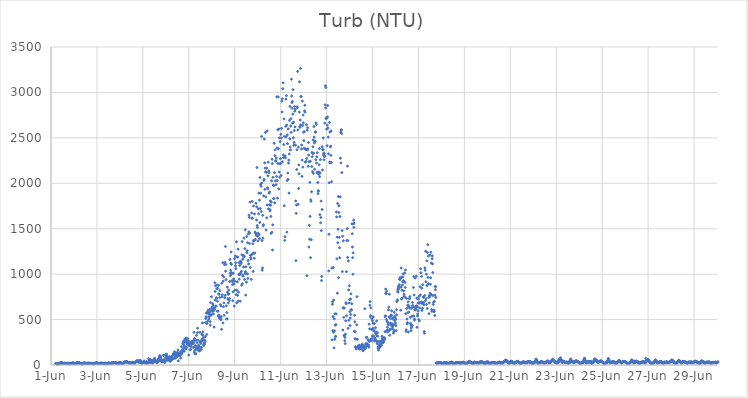
| Category | Turb (NTU) |
|---|---|
| 44348.208333333336 | 17.85 |
| 44348.21875 | 16.07 |
| 44348.229166666664 | 15.07 |
| 44348.239583333336 | 14.25 |
| 44348.25 | 13.07 |
| 44348.260416666664 | 12.13 |
| 44348.270833333336 | 12.9 |
| 44348.28125 | 11.44 |
| 44348.291666666664 | 12.86 |
| 44348.302083333336 | 12.12 |
| 44348.3125 | 12.98 |
| 44348.322916666664 | 14.67 |
| 44348.333333333336 | 13.97 |
| 44348.34375 | 14.42 |
| 44348.354166666664 | 16.25 |
| 44348.364583333336 | 13.14 |
| 44348.375 | 15.67 |
| 44348.385416666664 | 16.68 |
| 44348.395833333336 | 19.91 |
| 44348.40625 | 23.93 |
| 44348.416666666664 | 25.89 |
| 44348.427083333336 | 26.41 |
| 44348.4375 | 27.72 |
| 44348.447916666664 | 27.91 |
| 44348.458333333336 | 23.64 |
| 44348.46875 | 23.67 |
| 44348.479166666664 | 21.93 |
| 44348.489583333336 | 20.78 |
| 44348.5 | 20.99 |
| 44348.510416666664 | 19.15 |
| 44348.520833333336 | 20.27 |
| 44348.53125 | 17.49 |
| 44348.541666666664 | 16.05 |
| 44348.552083333336 | 17.76 |
| 44348.5625 | 17.19 |
| 44348.572916666664 | 16.97 |
| 44348.583333333336 | 18.19 |
| 44348.59375 | 17.05 |
| 44348.604166666664 | 18.88 |
| 44348.614583333336 | 17.87 |
| 44348.625 | 18.99 |
| 44348.635416666664 | 18.15 |
| 44348.645833333336 | 17.83 |
| 44348.65625 | 15.49 |
| 44348.666666666664 | 15.75 |
| 44348.677083333336 | 15.2 |
| 44348.6875 | 17.38 |
| 44348.697916666664 | 17.81 |
| 44348.708333333336 | 18.04 |
| 44348.71875 | 18.03 |
| 44348.729166666664 | 17.37 |
| 44348.739583333336 | 19.4 |
| 44348.75 | 18.3 |
| 44348.760416666664 | 17.67 |
| 44348.770833333336 | 16.87 |
| 44348.78125 | 15.52 |
| 44348.791666666664 | 14.73 |
| 44348.802083333336 | 13.63 |
| 44348.8125 | 12.52 |
| 44348.822916666664 | 15.52 |
| 44348.833333333336 | 14.12 |
| 44348.84375 | 16.25 |
| 44348.854166666664 | 16.66 |
| 44348.864583333336 | 17.64 |
| 44348.875 | 17.48 |
| 44348.885416666664 | 17.67 |
| 44348.895833333336 | 18.71 |
| 44348.90625 | 18.79 |
| 44348.916666666664 | 18.92 |
| 44348.927083333336 | 19.86 |
| 44348.9375 | 20.23 |
| 44348.947916666664 | 19.94 |
| 44348.958333333336 | 19.64 |
| 44348.96875 | 20.6 |
| 44348.979166666664 | 21.27 |
| 44348.989583333336 | 19.94 |
| 44349.0 | 19.46 |
| 44349.010416666664 | 18.15 |
| 44349.020833333336 | 17.81 |
| 44349.03125 | 16.41 |
| 44349.041666666664 | 16.4 |
| 44349.052083333336 | 15.35 |
| 44349.0625 | 16.81 |
| 44349.072916666664 | 17.22 |
| 44349.083333333336 | 18.48 |
| 44349.09375 | 19.93 |
| 44349.104166666664 | 20.25 |
| 44349.114583333336 | 21.39 |
| 44349.125 | 21.68 |
| 44349.135416666664 | 23.03 |
| 44349.145833333336 | 22.47 |
| 44349.15625 | 25.79 |
| 44349.166666666664 | 23.48 |
| 44349.177083333336 | 22.51 |
| 44349.1875 | 24.19 |
| 44349.197916666664 | 25 |
| 44349.208333333336 | 23.46 |
| 44349.21875 | 23.88 |
| 44349.229166666664 | 21.18 |
| 44349.239583333336 | 25.9 |
| 44349.25 | 16.99 |
| 44349.260416666664 | 19.4 |
| 44349.270833333336 | 17.35 |
| 44349.28125 | 15.46 |
| 44349.291666666664 | 15.87 |
| 44349.302083333336 | 14.51 |
| 44349.3125 | 13.87 |
| 44349.322916666664 | 13.88 |
| 44349.333333333336 | 12.87 |
| 44349.34375 | 13.28 |
| 44349.354166666664 | 12.64 |
| 44349.364583333336 | 13.79 |
| 44349.375 | 14.14 |
| 44349.385416666664 | 16.08 |
| 44349.395833333336 | 12.68 |
| 44349.40625 | 20.66 |
| 44349.416666666664 | 16.19 |
| 44349.427083333336 | 14.34 |
| 44349.4375 | 21.07 |
| 44349.447916666664 | 21.63 |
| 44349.458333333336 | 20.87 |
| 44349.46875 | 23.07 |
| 44349.479166666664 | 22.01 |
| 44349.489583333336 | 19.95 |
| 44349.5 | 18.13 |
| 44349.510416666664 | 18 |
| 44349.520833333336 | 17.74 |
| 44349.53125 | 17.18 |
| 44349.541666666664 | 16.9 |
| 44349.552083333336 | 16.03 |
| 44349.5625 | 15.2 |
| 44349.572916666664 | 13.88 |
| 44349.583333333336 | 18.49 |
| 44349.59375 | 15.82 |
| 44349.604166666664 | 21.06 |
| 44349.614583333336 | 19.11 |
| 44349.625 | 17.74 |
| 44349.635416666664 | 17.77 |
| 44349.645833333336 | 16.6 |
| 44349.65625 | 14.02 |
| 44349.666666666664 | 17.99 |
| 44349.677083333336 | 17.94 |
| 44349.6875 | 17.28 |
| 44349.697916666664 | 16.73 |
| 44349.708333333336 | 18.79 |
| 44349.71875 | 17.05 |
| 44349.729166666664 | 17.88 |
| 44349.739583333336 | 19.26 |
| 44349.75 | 17.71 |
| 44349.760416666664 | 17.61 |
| 44349.770833333336 | 17.71 |
| 44349.78125 | 16.47 |
| 44349.791666666664 | 17.19 |
| 44349.802083333336 | 17.46 |
| 44349.8125 | 15.03 |
| 44349.822916666664 | 14.03 |
| 44349.833333333336 | 12.57 |
| 44349.84375 | 12.94 |
| 44349.854166666664 | 12.1 |
| 44349.864583333336 | 14.65 |
| 44349.875 | 16.44 |
| 44349.885416666664 | 16.51 |
| 44349.895833333336 | 17.28 |
| 44349.90625 | 17.89 |
| 44349.916666666664 | 18.95 |
| 44349.927083333336 | 18.1 |
| 44349.9375 | 20.17 |
| 44349.947916666664 | 18.82 |
| 44349.958333333336 | 21.13 |
| 44349.96875 | 21.35 |
| 44349.979166666664 | 21.85 |
| 44349.989583333336 | 22.08 |
| 44350.0 | 22.59 |
| 44350.010416666664 | 22.57 |
| 44350.020833333336 | 22.45 |
| 44350.03125 | 20.55 |
| 44350.041666666664 | 19.71 |
| 44350.052083333336 | 18.04 |
| 44350.0625 | 16.86 |
| 44350.072916666664 | 16.02 |
| 44350.083333333336 | 15.61 |
| 44350.09375 | 14.43 |
| 44350.104166666664 | 15.7 |
| 44350.114583333336 | 16.55 |
| 44350.125 | 15.75 |
| 44350.135416666664 | 15.79 |
| 44350.145833333336 | 16.08 |
| 44350.15625 | 18.68 |
| 44350.166666666664 | 18.57 |
| 44350.177083333336 | 19.64 |
| 44350.1875 | 21.26 |
| 44350.197916666664 | 18.8 |
| 44350.208333333336 | 19.74 |
| 44350.21875 | 19.32 |
| 44350.229166666664 | 17.75 |
| 44350.239583333336 | 18.71 |
| 44350.25 | 18.85 |
| 44350.260416666664 | 16.88 |
| 44350.270833333336 | 17.99 |
| 44350.28125 | 17.18 |
| 44350.291666666664 | 16.92 |
| 44350.302083333336 | 17.74 |
| 44350.3125 | 18.36 |
| 44350.322916666664 | 16.48 |
| 44350.333333333336 | 15.77 |
| 44350.34375 | 14.31 |
| 44350.354166666664 | 11.96 |
| 44350.364583333336 | 15.38 |
| 44350.375 | 14.36 |
| 44350.385416666664 | 16.4 |
| 44350.395833333336 | 13.58 |
| 44350.40625 | 15.79 |
| 44350.416666666664 | 16.82 |
| 44350.427083333336 | 17.03 |
| 44350.4375 | 17.47 |
| 44350.447916666664 | 13.28 |
| 44350.458333333336 | 15.44 |
| 44350.46875 | 15.61 |
| 44350.479166666664 | 16.91 |
| 44350.489583333336 | 18.68 |
| 44350.5 | 20.53 |
| 44350.510416666664 | 20.93 |
| 44350.520833333336 | 19.89 |
| 44350.53125 | 20.03 |
| 44350.541666666664 | 18.54 |
| 44350.552083333336 | 18.82 |
| 44350.5625 | 19.69 |
| 44350.572916666664 | 17.64 |
| 44350.583333333336 | 18.13 |
| 44350.59375 | 17.07 |
| 44350.604166666664 | 16.56 |
| 44350.614583333336 | 17.87 |
| 44350.625 | 19.22 |
| 44350.635416666664 | 19.33 |
| 44350.645833333336 | 20.85 |
| 44350.65625 | 21.38 |
| 44350.666666666664 | 20.61 |
| 44350.677083333336 | 23.66 |
| 44350.6875 | 22.33 |
| 44350.697916666664 | 24.86 |
| 44350.708333333336 | 24.08 |
| 44350.71875 | 25.29 |
| 44350.729166666664 | 26.44 |
| 44350.739583333336 | 25.57 |
| 44350.75 | 27.58 |
| 44350.760416666664 | 25.7 |
| 44350.770833333336 | 24.64 |
| 44350.78125 | 26.09 |
| 44350.791666666664 | 27.63 |
| 44350.802083333336 | 24.21 |
| 44350.8125 | 24.14 |
| 44350.822916666664 | 21.72 |
| 44350.833333333336 | 22.23 |
| 44350.84375 | 21.31 |
| 44350.854166666664 | 19.41 |
| 44350.864583333336 | 19.21 |
| 44350.875 | 14.74 |
| 44350.885416666664 | 16.28 |
| 44350.895833333336 | 17.75 |
| 44350.90625 | 14.65 |
| 44350.916666666664 | 18.49 |
| 44350.927083333336 | 18.98 |
| 44350.9375 | 22.76 |
| 44350.947916666664 | 22.62 |
| 44350.958333333336 | 21.38 |
| 44350.96875 | 20.03 |
| 44350.979166666664 | 21.93 |
| 44350.989583333336 | 22.45 |
| 44351.0 | 21.67 |
| 44351.010416666664 | 22.64 |
| 44351.020833333336 | 22.24 |
| 44351.03125 | 23.25 |
| 44351.041666666664 | 22.71 |
| 44351.052083333336 | 21.84 |
| 44351.0625 | 20.34 |
| 44351.072916666664 | 19.56 |
| 44351.083333333336 | 18.44 |
| 44351.09375 | 18.37 |
| 44351.104166666664 | 19.43 |
| 44351.114583333336 | 16.82 |
| 44351.125 | 16.85 |
| 44351.135416666664 | 16.29 |
| 44351.145833333336 | 16.91 |
| 44351.15625 | 19.08 |
| 44351.166666666664 | 23.45 |
| 44351.177083333336 | 22.61 |
| 44351.1875 | 23.7 |
| 44351.197916666664 | 28.17 |
| 44351.208333333336 | 30.91 |
| 44351.21875 | 34.01 |
| 44351.229166666664 | 33.53 |
| 44351.239583333336 | 35.41 |
| 44351.25 | 38.29 |
| 44351.260416666664 | 38.94 |
| 44351.270833333336 | 36.71 |
| 44351.28125 | 36.52 |
| 44351.291666666664 | 34.05 |
| 44351.302083333336 | 35.5 |
| 44351.3125 | 33.63 |
| 44351.322916666664 | 31.69 |
| 44351.333333333336 | 33.26 |
| 44351.34375 | 30.76 |
| 44351.354166666664 | 29.39 |
| 44351.364583333336 | 28.56 |
| 44351.375 | 26.45 |
| 44351.385416666664 | 26 |
| 44351.395833333336 | 24.08 |
| 44351.40625 | 23.6 |
| 44351.416666666664 | 21.62 |
| 44351.427083333336 | 19.88 |
| 44351.4375 | 21.48 |
| 44351.447916666664 | 24.81 |
| 44351.458333333336 | 23.35 |
| 44351.46875 | 25.55 |
| 44351.479166666664 | 22.76 |
| 44351.489583333336 | 21.66 |
| 44351.5 | 27.77 |
| 44351.510416666664 | 29 |
| 44351.520833333336 | 28.95 |
| 44351.53125 | 29.71 |
| 44351.541666666664 | 29.24 |
| 44351.552083333336 | 26.77 |
| 44351.5625 | 24.59 |
| 44351.572916666664 | 24.35 |
| 44351.583333333336 | 22.07 |
| 44351.59375 | 23.46 |
| 44351.604166666664 | 23.51 |
| 44351.614583333336 | 23.75 |
| 44351.625 | 27.93 |
| 44351.635416666664 | 18.4 |
| 44351.645833333336 | 22.78 |
| 44351.65625 | 26.54 |
| 44351.666666666664 | 28.26 |
| 44351.677083333336 | 33.97 |
| 44351.6875 | 33.98 |
| 44351.697916666664 | 32.14 |
| 44351.708333333336 | 40.51 |
| 44351.71875 | 43.17 |
| 44351.729166666664 | 41.31 |
| 44351.739583333336 | 42.01 |
| 44351.75 | 46.94 |
| 44351.760416666664 | 44.83 |
| 44351.770833333336 | 40.1 |
| 44351.78125 | 40.45 |
| 44351.791666666664 | 41.38 |
| 44351.802083333336 | 43.02 |
| 44351.8125 | 40.6 |
| 44351.822916666664 | 45.24 |
| 44351.833333333336 | 30.93 |
| 44351.84375 | 28.58 |
| 44351.854166666664 | 39.39 |
| 44351.864583333336 | 43.09 |
| 44351.875 | 45.37 |
| 44351.885416666664 | 48.51 |
| 44351.895833333336 | 46.64 |
| 44351.90625 | 46.01 |
| 44351.916666666664 | 34.91 |
| 44351.927083333336 | 39.58 |
| 44351.9375 | 18.87 |
| 44351.947916666664 | 19.53 |
| 44351.958333333336 | 27.29 |
| 44351.96875 | 23.49 |
| 44351.979166666664 | 25.79 |
| 44351.989583333336 | 28.31 |
| 44352.0 | 29.22 |
| 44352.010416666664 | 29.58 |
| 44352.020833333336 | 29.78 |
| 44352.03125 | 31.6 |
| 44352.041666666664 | 28.29 |
| 44352.052083333336 | 30.88 |
| 44352.0625 | 43.72 |
| 44352.072916666664 | 31.56 |
| 44352.083333333336 | 26.26 |
| 44352.09375 | 27.5 |
| 44352.104166666664 | 26.5 |
| 44352.114583333336 | 27.31 |
| 44352.125 | 22.71 |
| 44352.135416666664 | 25 |
| 44352.145833333336 | 22.69 |
| 44352.15625 | 21.18 |
| 44352.166666666664 | 37.35 |
| 44352.177083333336 | 21.26 |
| 44352.1875 | 23.28 |
| 44352.197916666664 | 21.65 |
| 44352.208333333336 | 23.33 |
| 44352.21875 | 24.49 |
| 44352.229166666664 | 33.42 |
| 44352.239583333336 | 70.05 |
| 44352.25 | 35.85 |
| 44352.260416666664 | 34.89 |
| 44352.270833333336 | 30.18 |
| 44352.28125 | 31.63 |
| 44352.291666666664 | 35.97 |
| 44352.302083333336 | 48.26 |
| 44352.3125 | 35.88 |
| 44352.322916666664 | 61.89 |
| 44352.333333333336 | 31.15 |
| 44352.34375 | 27.95 |
| 44352.354166666664 | 27.7 |
| 44352.364583333336 | 50.33 |
| 44352.375 | 37.81 |
| 44352.385416666664 | 28.61 |
| 44352.395833333336 | 41.07 |
| 44352.40625 | 35.2 |
| 44352.416666666664 | 32.72 |
| 44352.427083333336 | 21.64 |
| 44352.4375 | 40.38 |
| 44352.447916666664 | 54.02 |
| 44352.458333333336 | 33.51 |
| 44352.46875 | 52.64 |
| 44352.479166666664 | 41.97 |
| 44352.489583333336 | 38.02 |
| 44352.5 | 58.2 |
| 44352.510416666664 | 74.88 |
| 44352.520833333336 | 64.57 |
| 44352.53125 | 50.5 |
| 44352.541666666664 | 37.51 |
| 44352.552083333336 | 40.25 |
| 44352.5625 | 35.63 |
| 44352.572916666664 | 45.71 |
| 44352.583333333336 | 31.49 |
| 44352.59375 | 38.78 |
| 44352.604166666664 | 38.75 |
| 44352.614583333336 | 29.01 |
| 44352.625 | 27.55 |
| 44352.635416666664 | 28.62 |
| 44352.645833333336 | 42.37 |
| 44352.65625 | 46.14 |
| 44352.666666666664 | 68.39 |
| 44352.677083333336 | 55.17 |
| 44352.6875 | 53.12 |
| 44352.697916666664 | 41.85 |
| 44352.708333333336 | 72.51 |
| 44352.71875 | 63.71 |
| 44352.729166666664 | 95.86 |
| 44352.739583333336 | 102.23 |
| 44352.75 | 94.01 |
| 44352.760416666664 | 95.13 |
| 44352.770833333336 | 90.69 |
| 44352.78125 | 84.67 |
| 44352.791666666664 | 67.16 |
| 44352.802083333336 | 47.5 |
| 44352.8125 | 44.14 |
| 44352.822916666664 | 51.01 |
| 44352.833333333336 | 36.93 |
| 44352.84375 | 37.6 |
| 44352.854166666664 | 37.08 |
| 44352.864583333336 | 36 |
| 44352.875 | 47.07 |
| 44352.885416666664 | 53.39 |
| 44352.895833333336 | 105.9 |
| 44352.90625 | 105.17 |
| 44352.916666666664 | 57 |
| 44352.927083333336 | 35.35 |
| 44352.9375 | 33.79 |
| 44352.947916666664 | 30.16 |
| 44352.958333333336 | 29.21 |
| 44352.96875 | 50.52 |
| 44352.979166666664 | 43.6 |
| 44352.989583333336 | 76.88 |
| 44353.0 | 116.6 |
| 44353.010416666664 | 87.84 |
| 44353.020833333336 | 107.22 |
| 44353.03125 | 118.88 |
| 44353.041666666664 | 55.02 |
| 44353.052083333336 | 68.74 |
| 44353.0625 | 53.42 |
| 44353.072916666664 | 68.28 |
| 44353.083333333336 | 83.18 |
| 44353.09375 | 89.84 |
| 44353.104166666664 | 56.17 |
| 44353.114583333336 | 61.85 |
| 44353.125 | 56.83 |
| 44353.135416666664 | 56.09 |
| 44353.145833333336 | 72 |
| 44353.15625 | 67.99 |
| 44353.166666666664 | 92.34 |
| 44353.177083333336 | 74.19 |
| 44353.1875 | 45.8 |
| 44353.197916666664 | 40.81 |
| 44353.208333333336 | 54.73 |
| 44353.21875 | 73.79 |
| 44353.229166666664 | 78.64 |
| 44353.239583333336 | 50.18 |
| 44353.25 | 91.39 |
| 44353.260416666664 | 75.49 |
| 44353.270833333336 | 74.68 |
| 44353.28125 | 97.75 |
| 44353.291666666664 | 66.84 |
| 44353.302083333336 | 72.04 |
| 44353.3125 | 68.23 |
| 44353.322916666664 | 117.46 |
| 44353.333333333336 | 118.39 |
| 44353.34375 | 128.01 |
| 44353.354166666664 | 119.22 |
| 44353.364583333336 | 119.96 |
| 44353.375 | 137.56 |
| 44353.385416666664 | 145.94 |
| 44353.395833333336 | 74.16 |
| 44353.40625 | 100.51 |
| 44353.416666666664 | 120.41 |
| 44353.427083333336 | 112.63 |
| 44353.4375 | 80.36 |
| 44353.447916666664 | 89.55 |
| 44353.458333333336 | 119.23 |
| 44353.46875 | 97.2 |
| 44353.479166666664 | 107.55 |
| 44353.489583333336 | 92.38 |
| 44353.5 | 120 |
| 44353.510416666664 | 139.45 |
| 44353.520833333336 | 123.11 |
| 44353.53125 | 165.12 |
| 44353.541666666664 | 46.11 |
| 44353.552083333336 | 126.15 |
| 44353.5625 | 104.93 |
| 44353.572916666664 | 111.69 |
| 44353.583333333336 | 110.53 |
| 44353.59375 | 108.09 |
| 44353.604166666664 | 105.6 |
| 44353.614583333336 | 109.18 |
| 44353.625 | 106.96 |
| 44353.635416666664 | 143.26 |
| 44353.645833333336 | 76.15 |
| 44353.65625 | 132.72 |
| 44353.666666666664 | 128.19 |
| 44353.677083333336 | 203.21 |
| 44353.6875 | 131.46 |
| 44353.697916666664 | 125.43 |
| 44353.708333333336 | 161.03 |
| 44353.71875 | 142.62 |
| 44353.729166666664 | 171.73 |
| 44353.739583333336 | 233.69 |
| 44353.75 | 171.88 |
| 44353.760416666664 | 257.77 |
| 44353.770833333336 | 250.94 |
| 44353.78125 | 188.13 |
| 44353.791666666664 | 218.44 |
| 44353.802083333336 | 151.59 |
| 44353.8125 | 207.01 |
| 44353.822916666664 | 279.67 |
| 44353.833333333336 | 248.93 |
| 44353.84375 | 288.87 |
| 44353.854166666664 | 268.61 |
| 44353.864583333336 | 284.29 |
| 44353.875 | 178.12 |
| 44353.885416666664 | 277.24 |
| 44353.895833333336 | 295.56 |
| 44353.90625 | 194.42 |
| 44353.916666666664 | 245.82 |
| 44353.927083333336 | 252.08 |
| 44353.9375 | 224.45 |
| 44353.947916666664 | 230.15 |
| 44353.958333333336 | 288.77 |
| 44353.96875 | 263.06 |
| 44353.979166666664 | 240.55 |
| 44353.989583333336 | 260.5 |
| 44354.0 | 109.41 |
| 44354.010416666664 | 214.73 |
| 44354.020833333336 | 242.39 |
| 44354.03125 | 220.57 |
| 44354.041666666664 | 230.61 |
| 44354.052083333336 | 167.12 |
| 44354.0625 | 213.1 |
| 44354.072916666664 | 218.9 |
| 44354.083333333336 | 171.55 |
| 44354.09375 | 203.04 |
| 44354.104166666664 | 250.13 |
| 44354.114583333336 | 253.6 |
| 44354.125 | 238.21 |
| 44354.135416666664 | 246.68 |
| 44354.145833333336 | 255.12 |
| 44354.15625 | 233.05 |
| 44354.166666666664 | 235.19 |
| 44354.177083333336 | 251.48 |
| 44354.1875 | 266.5 |
| 44354.197916666664 | 191.96 |
| 44354.208333333336 | 242.02 |
| 44354.21875 | 269.42 |
| 44354.229166666664 | 359.93 |
| 44354.239583333336 | 141.14 |
| 44354.25 | 289.66 |
| 44354.260416666664 | 160.17 |
| 44354.270833333336 | 123.07 |
| 44354.28125 | 214.51 |
| 44354.291666666664 | 200.41 |
| 44354.302083333336 | 273.36 |
| 44354.3125 | 123.96 |
| 44354.322916666664 | 172.63 |
| 44354.333333333336 | 325.3 |
| 44354.34375 | 200.34 |
| 44354.354166666664 | 246.55 |
| 44354.364583333336 | 191 |
| 44354.375 | 355.65 |
| 44354.385416666664 | 405.62 |
| 44354.395833333336 | 184.52 |
| 44354.40625 | 272.7 |
| 44354.416666666664 | 160.17 |
| 44354.427083333336 | 218.47 |
| 44354.4375 | 207.4 |
| 44354.447916666664 | 181.84 |
| 44354.458333333336 | 161.26 |
| 44354.46875 | 153.79 |
| 44354.479166666664 | 359.55 |
| 44354.489583333336 | 254.72 |
| 44354.5 | 192.12 |
| 44354.510416666664 | 259.23 |
| 44354.520833333336 | 236.84 |
| 44354.53125 | 253.24 |
| 44354.541666666664 | 169.14 |
| 44354.552083333336 | 191.68 |
| 44354.5625 | 338.4 |
| 44354.572916666664 | 284.12 |
| 44354.583333333336 | 267.43 |
| 44354.59375 | 463.25 |
| 44354.604166666664 | 330.39 |
| 44354.614583333336 | 363.42 |
| 44354.625 | 280.48 |
| 44354.635416666664 | 301.14 |
| 44354.645833333336 | 212.95 |
| 44354.65625 | 223.66 |
| 44354.666666666664 | 229.57 |
| 44354.677083333336 | 244.43 |
| 44354.6875 | 231.66 |
| 44354.697916666664 | 271.87 |
| 44354.708333333336 | 255.72 |
| 44354.71875 | 313.21 |
| 44354.729166666664 | 468.1 |
| 44354.739583333336 | 512.35 |
| 44354.75 | 527.61 |
| 44354.760416666664 | 528.84 |
| 44354.770833333336 | 571.52 |
| 44354.78125 | 336.27 |
| 44354.791666666664 | 455.08 |
| 44354.802083333336 | 577.58 |
| 44354.8125 | 577.97 |
| 44354.822916666664 | 481.7 |
| 44354.833333333336 | 571.96 |
| 44354.84375 | 604.09 |
| 44354.854166666664 | 597.85 |
| 44354.864583333336 | 563.2 |
| 44354.875 | 506.18 |
| 44354.885416666664 | 530.46 |
| 44354.895833333336 | 559.66 |
| 44354.90625 | 574.88 |
| 44354.916666666664 | 610.34 |
| 44354.927083333336 | 477.73 |
| 44354.9375 | 438.96 |
| 44354.947916666664 | 687.68 |
| 44354.958333333336 | 547.04 |
| 44354.96875 | 595.07 |
| 44354.979166666664 | 552.72 |
| 44354.989583333336 | 751.48 |
| 44355.0 | 622.74 |
| 44355.010416666664 | 636.25 |
| 44355.020833333336 | 622.7 |
| 44355.03125 | 591.52 |
| 44355.041666666664 | 673.37 |
| 44355.052083333336 | 627.64 |
| 44355.0625 | 657.28 |
| 44355.072916666664 | 562.12 |
| 44355.083333333336 | 597.35 |
| 44355.09375 | 616.25 |
| 44355.104166666664 | 416.86 |
| 44355.114583333336 | 628.23 |
| 44355.125 | 610.71 |
| 44355.135416666664 | 905.19 |
| 44355.145833333336 | 809.61 |
| 44355.15625 | 714.43 |
| 44355.166666666664 | 871.69 |
| 44355.177083333336 | 646.54 |
| 44355.1875 | 648.88 |
| 44355.197916666664 | 740.19 |
| 44355.208333333336 | 736.57 |
| 44355.21875 | 838.51 |
| 44355.229166666664 | 881.53 |
| 44355.239583333336 | 591.51 |
| 44355.25 | 701.06 |
| 44355.260416666664 | 844.31 |
| 44355.270833333336 | 591.96 |
| 44355.28125 | 538.32 |
| 44355.291666666664 | 876.88 |
| 44355.302083333336 | 783 |
| 44355.3125 | 550.72 |
| 44355.322916666664 | 777.66 |
| 44355.333333333336 | 516.76 |
| 44355.34375 | 741.84 |
| 44355.354166666664 | 819.46 |
| 44355.364583333336 | 529.81 |
| 44355.375 | 664.98 |
| 44355.385416666664 | 506.16 |
| 44355.395833333336 | 498.33 |
| 44355.40625 | 649.35 |
| 44355.416666666664 | 531.36 |
| 44355.427083333336 | 392.89 |
| 44355.4375 | 899.6 |
| 44355.447916666664 | 750.97 |
| 44355.458333333336 | 773.02 |
| 44355.46875 | 986.4 |
| 44355.479166666664 | 1126.12 |
| 44355.489583333336 | 463.15 |
| 44355.5 | 923.03 |
| 44355.510416666664 | 641.79 |
| 44355.520833333336 | 970.09 |
| 44355.53125 | 682.07 |
| 44355.541666666664 | 547.61 |
| 44355.552083333336 | 1106.27 |
| 44355.5625 | 740.06 |
| 44355.572916666664 | 1129.07 |
| 44355.583333333336 | 766.36 |
| 44355.59375 | 1304.26 |
| 44355.604166666664 | 1031.29 |
| 44355.614583333336 | 1106.24 |
| 44355.625 | 939.1 |
| 44355.635416666664 | 651.26 |
| 44355.645833333336 | 506.11 |
| 44355.65625 | 576.97 |
| 44355.666666666664 | 508.57 |
| 44355.677083333336 | 856.69 |
| 44355.6875 | 801.46 |
| 44355.697916666664 | 728.44 |
| 44355.708333333336 | 778.46 |
| 44355.71875 | 683.21 |
| 44355.729166666664 | 783.29 |
| 44355.739583333336 | 826.35 |
| 44355.75 | 783.45 |
| 44355.760416666664 | 711.05 |
| 44355.770833333336 | 730.46 |
| 44355.78125 | 919.41 |
| 44355.791666666664 | 1161.86 |
| 44355.802083333336 | 1010.73 |
| 44355.8125 | 984.35 |
| 44355.822916666664 | 1041.88 |
| 44355.833333333336 | 1118.16 |
| 44355.84375 | 1243.56 |
| 44355.854166666664 | 1107.01 |
| 44355.864583333336 | 1015.07 |
| 44355.875 | 1003.14 |
| 44355.885416666664 | 929.24 |
| 44355.895833333336 | 916.61 |
| 44355.90625 | 884.47 |
| 44355.916666666664 | 706.69 |
| 44355.927083333336 | 805.04 |
| 44355.9375 | 1010.44 |
| 44355.947916666664 | 926.06 |
| 44355.958333333336 | 946.62 |
| 44355.96875 | 890.94 |
| 44355.979166666664 | 648.55 |
| 44355.989583333336 | 1170.06 |
| 44356.0 | 822.72 |
| 44356.010416666664 | 920.44 |
| 44356.020833333336 | 1200.23 |
| 44356.03125 | 1091.6 |
| 44356.041666666664 | 1126.57 |
| 44356.052083333336 | 1060.79 |
| 44356.0625 | 773.5 |
| 44356.072916666664 | 1356.23 |
| 44356.083333333336 | 684.24 |
| 44356.09375 | 824 |
| 44356.104166666664 | 1187.98 |
| 44356.114583333336 | 915.86 |
| 44356.125 | 766.58 |
| 44356.135416666664 | 1187.22 |
| 44356.145833333336 | 1275.39 |
| 44356.15625 | 701.5 |
| 44356.166666666664 | 802.69 |
| 44356.177083333336 | 995.66 |
| 44356.1875 | 1125.98 |
| 44356.197916666664 | 944.09 |
| 44356.208333333336 | 995.66 |
| 44356.21875 | 1094.65 |
| 44356.229166666664 | 998.25 |
| 44356.239583333336 | 702.42 |
| 44356.25 | 1142.83 |
| 44356.260416666664 | 1015.14 |
| 44356.270833333336 | 1116.98 |
| 44356.28125 | 1129.71 |
| 44356.291666666664 | 1030.83 |
| 44356.302083333336 | 878.9 |
| 44356.3125 | 1212.5 |
| 44356.322916666664 | 1358.48 |
| 44356.333333333336 | 895.23 |
| 44356.34375 | 989.69 |
| 44356.354166666664 | 1164.28 |
| 44356.364583333336 | 976.8 |
| 44356.375 | 1206.9 |
| 44356.385416666664 | 1078.78 |
| 44356.395833333336 | 1190.08 |
| 44356.40625 | 1395.83 |
| 44356.416666666664 | 1197.72 |
| 44356.427083333336 | 940.71 |
| 44356.4375 | 1281.54 |
| 44356.447916666664 | 1008.96 |
| 44356.458333333336 | 1488.75 |
| 44356.46875 | 1028.37 |
| 44356.479166666664 | 769.44 |
| 44356.489583333336 | 1080.5 |
| 44356.5 | 1004.04 |
| 44356.510416666664 | 912.4 |
| 44356.520833333336 | 1413.98 |
| 44356.53125 | 1235.76 |
| 44356.541666666664 | 1258.57 |
| 44356.552083333336 | 1002.31 |
| 44356.5625 | 1346.86 |
| 44356.572916666664 | 952.94 |
| 44356.583333333336 | 1149.75 |
| 44356.59375 | 1443.2 |
| 44356.604166666664 | 1112.71 |
| 44356.614583333336 | 1464.85 |
| 44356.625 | 1649.7 |
| 44356.635416666664 | 1624.68 |
| 44356.645833333336 | 1337.34 |
| 44356.65625 | 1453.15 |
| 44356.666666666664 | 1792.38 |
| 44356.677083333336 | 1073.87 |
| 44356.6875 | 1206.86 |
| 44356.697916666664 | 1183.1 |
| 44356.708333333336 | 1167.63 |
| 44356.71875 | 942.16 |
| 44356.729166666664 | 1213.25 |
| 44356.739583333336 | 1673.3 |
| 44356.75 | 1616.6 |
| 44356.760416666664 | 1801.05 |
| 44356.770833333336 | 1616.06 |
| 44356.78125 | 1225.73 |
| 44356.791666666664 | 1334.06 |
| 44356.802083333336 | 1030 |
| 44356.8125 | 1369.18 |
| 44356.822916666664 | 1750.47 |
| 44356.833333333336 | 1230.34 |
| 44356.84375 | 1367.25 |
| 44356.854166666664 | 1174.54 |
| 44356.864583333336 | 1662.88 |
| 44356.875 | 1233.61 |
| 44356.885416666664 | 1463.5 |
| 44356.895833333336 | 1381.16 |
| 44356.90625 | 1448.75 |
| 44356.916666666664 | 1448.82 |
| 44356.927083333336 | 1780.76 |
| 44356.9375 | 1426.65 |
| 44356.947916666664 | 1595.84 |
| 44356.958333333336 | 1741.18 |
| 44356.96875 | 2173.06 |
| 44356.979166666664 | 1535.1 |
| 44356.989583333336 | 1512.93 |
| 44357.0 | 1419.17 |
| 44357.010416666664 | 1365.6 |
| 44357.020833333336 | 1449.71 |
| 44357.03125 | 1718.05 |
| 44357.041666666664 | 1663.8 |
| 44357.052083333336 | 1891.66 |
| 44357.0625 | 1435.11 |
| 44357.072916666664 | 1814.21 |
| 44357.083333333336 | 1390.91 |
| 44357.09375 | 1568.79 |
| 44357.104166666664 | 2063.89 |
| 44357.114583333336 | 1722.75 |
| 44357.125 | 1987.44 |
| 44357.135416666664 | 1890.64 |
| 44357.145833333336 | 1966.86 |
| 44357.15625 | 1688.53 |
| 44357.166666666664 | 2515.73 |
| 44357.177083333336 | 2002.57 |
| 44357.1875 | 1368.57 |
| 44357.197916666664 | 1043.53 |
| 44357.208333333336 | 1068.62 |
| 44357.21875 | 1647.4 |
| 44357.229166666664 | 1396.12 |
| 44357.239583333336 | 1532.67 |
| 44357.25 | 1545.29 |
| 44357.260416666664 | 1861.36 |
| 44357.270833333336 | 2032.74 |
| 44357.28125 | 2043.81 |
| 44357.291666666664 | 2486.46 |
| 44357.302083333336 | 2225.38 |
| 44357.3125 | 1933.02 |
| 44357.322916666664 | 2166.95 |
| 44357.333333333336 | 2558.86 |
| 44357.34375 | 2125.77 |
| 44357.354166666664 | 1850.46 |
| 44357.364583333336 | 1485.72 |
| 44357.375 | 2119.57 |
| 44357.385416666664 | 2166.65 |
| 44357.395833333336 | 1619.73 |
| 44357.40625 | 1761.13 |
| 44357.416666666664 | 2576.48 |
| 44357.427083333336 | 1949.61 |
| 44357.4375 | 1940.59 |
| 44357.447916666664 | 2083.1 |
| 44357.458333333336 | 2232.2 |
| 44357.46875 | 1718.71 |
| 44357.479166666664 | 2135.15 |
| 44357.489583333336 | 2118.45 |
| 44357.5 | 1890.96 |
| 44357.510416666664 | 1763.45 |
| 44357.520833333336 | 1904.93 |
| 44357.53125 | 1709.83 |
| 44357.541666666664 | 1695.75 |
| 44357.552083333336 | 1804.98 |
| 44357.5625 | 1757.69 |
| 44357.572916666664 | 1634.86 |
| 44357.583333333336 | 1449.01 |
| 44357.59375 | 1792.56 |
| 44357.604166666664 | 2027.35 |
| 44357.614583333336 | 1460.53 |
| 44357.625 | 2264.52 |
| 44357.635416666664 | 2216.88 |
| 44357.645833333336 | 1266.19 |
| 44357.65625 | 1542.81 |
| 44357.666666666664 | 2065.37 |
| 44357.677083333336 | 1979.84 |
| 44357.6875 | 1831.79 |
| 44357.697916666664 | 1974.41 |
| 44357.708333333336 | 1830.15 |
| 44357.71875 | 2439.76 |
| 44357.729166666664 | 2117 |
| 44357.739583333336 | 1785.38 |
| 44357.75 | 2303.18 |
| 44357.760416666664 | 2368.04 |
| 44357.770833333336 | 2026.61 |
| 44357.78125 | 2243.59 |
| 44357.791666666664 | 2249.77 |
| 44357.802083333336 | 1984.84 |
| 44357.8125 | 2278.98 |
| 44357.822916666664 | 2074.7 |
| 44357.833333333336 | 2951.83 |
| 44357.84375 | 2389.4 |
| 44357.854166666664 | 2030.61 |
| 44357.864583333336 | 1837.05 |
| 44357.875 | 2588.82 |
| 44357.885416666664 | 2217.49 |
| 44357.895833333336 | 2950.58 |
| 44357.90625 | 2380.77 |
| 44357.916666666664 | 1939.04 |
| 44357.927083333336 | 2597.17 |
| 44357.9375 | 2123.33 |
| 44357.947916666664 | 2500.23 |
| 44357.958333333336 | 2066.03 |
| 44357.96875 | 2215.26 |
| 44357.979166666664 | 2458.64 |
| 44357.989583333336 | 2270.36 |
| 44358.0 | 2219.13 |
| 44358.010416666664 | 2538.6 |
| 44358.020833333336 | 2086.76 |
| 44358.03125 | 2499.42 |
| 44358.041666666664 | 2604.23 |
| 44358.052083333336 | 2904.51 |
| 44358.0625 | 2784.89 |
| 44358.072916666664 | 2930.25 |
| 44358.083333333336 | 2236.46 |
| 44358.09375 | 3041.58 |
| 44358.104166666664 | 3105.76 |
| 44358.114583333336 | 2313.14 |
| 44358.125 | 2282.4 |
| 44358.135416666664 | 2426.3 |
| 44358.145833333336 | 2708.82 |
| 44358.15625 | 1752.47 |
| 44358.166666666664 | 2516.32 |
| 44358.177083333336 | 1371.71 |
| 44358.1875 | 1411.42 |
| 44358.197916666664 | 2300.3 |
| 44358.208333333336 | 2280.98 |
| 44358.21875 | 2627.37 |
| 44358.229166666664 | 2926 |
| 44358.239583333336 | 2510.52 |
| 44358.25 | 2964.08 |
| 44358.260416666664 | 2640.11 |
| 44358.270833333336 | 1462.38 |
| 44358.28125 | 2030.29 |
| 44358.291666666664 | 2531.16 |
| 44358.302083333336 | 2436.57 |
| 44358.3125 | 2112.73 |
| 44358.322916666664 | 2042.58 |
| 44358.333333333336 | 2599.2 |
| 44358.34375 | 2222.48 |
| 44358.354166666664 | 2254.86 |
| 44358.364583333336 | 1892.26 |
| 44358.375 | 2323.23 |
| 44358.385416666664 | 2692.39 |
| 44358.395833333336 | 2489.97 |
| 44358.40625 | 2846.18 |
| 44358.416666666664 | 2397.95 |
| 44358.427083333336 | 2366.49 |
| 44358.4375 | 2630.44 |
| 44358.447916666664 | 2710.97 |
| 44358.458333333336 | 2560.51 |
| 44358.46875 | 3145.22 |
| 44358.479166666664 | 2960.9 |
| 44358.489583333336 | 2888.41 |
| 44358.5 | 2824.68 |
| 44358.510416666664 | 2900.76 |
| 44358.520833333336 | 2662.99 |
| 44358.53125 | 2761.5 |
| 44358.541666666664 | 3029.87 |
| 44358.552083333336 | 2500.7 |
| 44358.5625 | 2671.67 |
| 44358.572916666664 | 2417.52 |
| 44358.583333333336 | 2449.53 |
| 44358.59375 | 2580.33 |
| 44358.604166666664 | 2845.07 |
| 44358.614583333336 | 2793.62 |
| 44358.625 | 2619.73 |
| 44358.635416666664 | 2813.91 |
| 44358.645833333336 | 2419.67 |
| 44358.65625 | 1805.52 |
| 44358.666666666664 | 1148.35 |
| 44358.677083333336 | 1669.18 |
| 44358.6875 | 1760.81 |
| 44358.697916666664 | 2151.62 |
| 44358.708333333336 | 2368.63 |
| 44358.71875 | 2841.52 |
| 44358.729166666664 | 2832.64 |
| 44358.739583333336 | 3230.86 |
| 44358.75 | 2586.95 |
| 44358.760416666664 | 1768.55 |
| 44358.770833333336 | 2397.87 |
| 44358.78125 | 1943.01 |
| 44358.791666666664 | 2202.53 |
| 44358.802083333336 | 2105.34 |
| 44358.8125 | 2782.84 |
| 44358.822916666664 | 3116.89 |
| 44358.833333333336 | 2627.3 |
| 44358.84375 | 2615.69 |
| 44358.854166666664 | 2696.22 |
| 44358.864583333336 | 3263.34 |
| 44358.875 | 2642.81 |
| 44358.885416666664 | 2955.97 |
| 44358.895833333336 | 2952.96 |
| 44358.90625 | 2377.85 |
| 44358.916666666664 | 2422.54 |
| 44358.927083333336 | 2076.21 |
| 44358.9375 | 2254.87 |
| 44358.947916666664 | 2904.43 |
| 44358.958333333336 | 2635.48 |
| 44358.96875 | 2177.99 |
| 44358.979166666664 | 2751.07 |
| 44358.989583333336 | 2665.95 |
| 44359.0 | 2562.76 |
| 44359.010416666664 | 2469.46 |
| 44359.020833333336 | 2384.74 |
| 44359.03125 | 2567.39 |
| 44359.041666666664 | 2796.32 |
| 44359.052083333336 | 2858.99 |
| 44359.0625 | 2783.39 |
| 44359.072916666664 | 2233.5 |
| 44359.083333333336 | 2377.53 |
| 44359.09375 | 2374.95 |
| 44359.104166666664 | 2240.04 |
| 44359.114583333336 | 2371.89 |
| 44359.125 | 2644.51 |
| 44359.135416666664 | 2273.53 |
| 44359.145833333336 | 982.41 |
| 44359.15625 | 2585.59 |
| 44359.166666666664 | 2368.19 |
| 44359.177083333336 | 2611.52 |
| 44359.1875 | 2378.93 |
| 44359.197916666664 | 2186.84 |
| 44359.208333333336 | 2449.04 |
| 44359.21875 | 2310.22 |
| 44359.229166666664 | 1298.83 |
| 44359.239583333336 | 2238.48 |
| 44359.25 | 1537.62 |
| 44359.260416666664 | 1385.21 |
| 44359.270833333336 | 2009.77 |
| 44359.28125 | 1635.17 |
| 44359.291666666664 | 2242.21 |
| 44359.302083333336 | 1181.63 |
| 44359.3125 | 1817.7 |
| 44359.322916666664 | 1802.87 |
| 44359.333333333336 | 1377.74 |
| 44359.34375 | 1906.67 |
| 44359.354166666664 | 2184.61 |
| 44359.364583333336 | 2339.56 |
| 44359.375 | 2292.5 |
| 44359.385416666664 | 2128.06 |
| 44359.395833333336 | 2328.04 |
| 44359.40625 | 2401.73 |
| 44359.416666666664 | 2477.9 |
| 44359.427083333336 | 2109.04 |
| 44359.4375 | 2330.28 |
| 44359.447916666664 | 2624.44 |
| 44359.458333333336 | 2509.14 |
| 44359.46875 | 2443.93 |
| 44359.479166666664 | 2153.96 |
| 44359.489583333336 | 2458.74 |
| 44359.5 | 2464 |
| 44359.510416666664 | 2561.21 |
| 44359.520833333336 | 2566.34 |
| 44359.53125 | 2259.38 |
| 44359.541666666664 | 2664.23 |
| 44359.552083333336 | 2649.14 |
| 44359.5625 | 2222.09 |
| 44359.572916666664 | 2292.14 |
| 44359.583333333336 | 2116.69 |
| 44359.59375 | 2336.1 |
| 44359.604166666664 | 2122.35 |
| 44359.614583333336 | 2008.8 |
| 44359.625 | 1886.72 |
| 44359.635416666664 | 1919.13 |
| 44359.645833333336 | 1913.54 |
| 44359.65625 | 2099.45 |
| 44359.666666666664 | 2125.01 |
| 44359.677083333336 | 2203.5 |
| 44359.6875 | 2381.78 |
| 44359.697916666664 | 2072.98 |
| 44359.708333333336 | 1654.87 |
| 44359.71875 | 2113.85 |
| 44359.729166666664 | 2259.47 |
| 44359.739583333336 | 1565 |
| 44359.75 | 1623.3 |
| 44359.760416666664 | 1804.36 |
| 44359.770833333336 | 1478.93 |
| 44359.78125 | 929.29 |
| 44359.791666666664 | 974.14 |
| 44359.802083333336 | 1711.48 |
| 44359.8125 | 2402.68 |
| 44359.822916666664 | 2146.66 |
| 44359.833333333336 | 2372.4 |
| 44359.84375 | 2370.04 |
| 44359.854166666664 | 2499.2 |
| 44359.864583333336 | 2312.03 |
| 44359.875 | 2330.81 |
| 44359.885416666664 | 2259.27 |
| 44359.895833333336 | 2332.08 |
| 44359.90625 | 2293.8 |
| 44359.916666666664 | 2299.01 |
| 44359.927083333336 | 2662.47 |
| 44359.9375 | 2864.29 |
| 44359.947916666664 | 3073.45 |
| 44359.958333333336 | 2830.13 |
| 44359.96875 | 3052.91 |
| 44359.979166666664 | 2712.26 |
| 44359.989583333336 | 2722.05 |
| 44360.0 | 2594.84 |
| 44360.010416666664 | 2716.5 |
| 44360.020833333336 | 2413.58 |
| 44360.03125 | 2639.07 |
| 44360.041666666664 | 2729.48 |
| 44360.052083333336 | 2855.6 |
| 44360.0625 | 2607.96 |
| 44360.072916666664 | 2508.2 |
| 44360.083333333336 | 2324.1 |
| 44360.09375 | 1035.57 |
| 44360.104166666664 | 1438.81 |
| 44360.114583333336 | 2006 |
| 44360.125 | 2669.2 |
| 44360.135416666664 | 2232.99 |
| 44360.145833333336 | 2563.44 |
| 44360.15625 | 2222.34 |
| 44360.166666666664 | 2401.35 |
| 44360.177083333336 | 2408.36 |
| 44360.1875 | 2307.39 |
| 44360.197916666664 | 2577.07 |
| 44360.208333333336 | 2229.59 |
| 44360.21875 | 2017.07 |
| 44360.229166666664 | 1067.4 |
| 44360.239583333336 | 276.73 |
| 44360.25 | 668.7 |
| 44360.260416666664 | 694.48 |
| 44360.270833333336 | 378.62 |
| 44360.28125 | 532.88 |
| 44360.291666666664 | 1073.88 |
| 44360.302083333336 | 361.6 |
| 44360.3125 | 715.02 |
| 44360.322916666664 | 187.99 |
| 44360.333333333336 | 508.41 |
| 44360.34375 | 375.6 |
| 44360.354166666664 | 283.1 |
| 44360.364583333336 | 564.04 |
| 44360.375 | 438.59 |
| 44360.385416666664 | 311.16 |
| 44360.395833333336 | 316.07 |
| 44360.40625 | 445.48 |
| 44360.416666666664 | 562.28 |
| 44360.427083333336 | 1683.34 |
| 44360.4375 | 1630.24 |
| 44360.447916666664 | 1168.1 |
| 44360.458333333336 | 1407.01 |
| 44360.46875 | 790.29 |
| 44360.479166666664 | 1778.56 |
| 44360.489583333336 | 1345.96 |
| 44360.5 | 1493.79 |
| 44360.510416666664 | 1855.39 |
| 44360.520833333336 | 961.39 |
| 44360.53125 | 1678.89 |
| 44360.541666666664 | 1752.92 |
| 44360.552083333336 | 1404.47 |
| 44360.5625 | 1290.83 |
| 44360.572916666664 | 1179.94 |
| 44360.583333333336 | 1633.69 |
| 44360.59375 | 1850.21 |
| 44360.604166666664 | 2275.63 |
| 44360.614583333336 | 2561.1 |
| 44360.625 | 2223.83 |
| 44360.635416666664 | 2588.83 |
| 44360.645833333336 | 2585.61 |
| 44360.65625 | 2547.66 |
| 44360.666666666664 | 2117.58 |
| 44360.677083333336 | 1479.78 |
| 44360.6875 | 1028.3 |
| 44360.697916666664 | 1417.18 |
| 44360.708333333336 | 384.73 |
| 44360.71875 | 629.36 |
| 44360.729166666664 | 1367.31 |
| 44360.739583333336 | 626.17 |
| 44360.75 | 524.62 |
| 44360.760416666664 | 323.94 |
| 44360.770833333336 | 626.74 |
| 44360.78125 | 325.65 |
| 44360.791666666664 | 268.05 |
| 44360.802083333336 | 304.03 |
| 44360.8125 | 235.17 |
| 44360.822916666664 | 340.2 |
| 44360.833333333336 | 485.61 |
| 44360.84375 | 685.78 |
| 44360.854166666664 | 673.29 |
| 44360.864583333336 | 1027.5 |
| 44360.875 | 542.26 |
| 44360.885416666664 | 1370.78 |
| 44360.895833333336 | 1499.93 |
| 44360.90625 | 2189.44 |
| 44360.916666666664 | 1183.94 |
| 44360.927083333336 | 1368.43 |
| 44360.9375 | 403.19 |
| 44360.947916666664 | 1145.53 |
| 44360.958333333336 | 826.54 |
| 44360.96875 | 492.6 |
| 44360.979166666664 | 683.21 |
| 44360.989583333336 | 872.62 |
| 44361.0 | 720.8 |
| 44361.010416666664 | 585.84 |
| 44361.020833333336 | 434.37 |
| 44361.03125 | 518.31 |
| 44361.041666666664 | 725.65 |
| 44361.052083333336 | 556.75 |
| 44361.0625 | 783.27 |
| 44361.072916666664 | 608.74 |
| 44361.083333333336 | 607.53 |
| 44361.09375 | 674.11 |
| 44361.104166666664 | 1552.35 |
| 44361.114583333336 | 1444.54 |
| 44361.125 | 1298.14 |
| 44361.135416666664 | 1181.33 |
| 44361.145833333336 | 998.72 |
| 44361.15625 | 1234.69 |
| 44361.166666666664 | 1554.34 |
| 44361.177083333336 | 1594.42 |
| 44361.1875 | 1514.48 |
| 44361.197916666664 | 1562.2 |
| 44361.208333333336 | 372.92 |
| 44361.21875 | 547.96 |
| 44361.229166666664 | 475.37 |
| 44361.239583333336 | 290.4 |
| 44361.25 | 364.53 |
| 44361.260416666664 | 199.49 |
| 44361.270833333336 | 195.45 |
| 44361.28125 | 284.74 |
| 44361.291666666664 | 176.86 |
| 44361.302083333336 | 191.13 |
| 44361.3125 | 443.32 |
| 44361.322916666664 | 752.05 |
| 44361.333333333336 | 195.52 |
| 44361.34375 | 282.29 |
| 44361.354166666664 | 200.47 |
| 44361.364583333336 | 199.29 |
| 44361.375 | 197.41 |
| 44361.385416666664 | 197.8 |
| 44361.395833333336 | 189.53 |
| 44361.40625 | 218.29 |
| 44361.416666666664 | 217.04 |
| 44361.427083333336 | 176.14 |
| 44361.4375 | 180.19 |
| 44361.447916666664 | 194.02 |
| 44361.458333333336 | 186.97 |
| 44361.46875 | 195.53 |
| 44361.479166666664 | 183.48 |
| 44361.489583333336 | 202.5 |
| 44361.5 | 188.93 |
| 44361.510416666664 | 190.91 |
| 44361.520833333336 | 206.2 |
| 44361.53125 | 221.35 |
| 44361.541666666664 | 199.37 |
| 44361.552083333336 | 227.87 |
| 44361.5625 | 212.87 |
| 44361.572916666664 | 167.06 |
| 44361.583333333336 | 156.68 |
| 44361.59375 | 207.74 |
| 44361.604166666664 | 203.28 |
| 44361.614583333336 | 191.03 |
| 44361.625 | 209.77 |
| 44361.635416666664 | 208.49 |
| 44361.645833333336 | 208.11 |
| 44361.65625 | 176.06 |
| 44361.666666666664 | 619.18 |
| 44361.677083333336 | 203.54 |
| 44361.6875 | 184.88 |
| 44361.697916666664 | 185.49 |
| 44361.708333333336 | 234.16 |
| 44361.71875 | 211.99 |
| 44361.729166666664 | 303.33 |
| 44361.739583333336 | 208.34 |
| 44361.75 | 305.2 |
| 44361.760416666664 | 234.79 |
| 44361.770833333336 | 219.56 |
| 44361.78125 | 216.04 |
| 44361.791666666664 | 221.88 |
| 44361.802083333336 | 216.83 |
| 44361.8125 | 279.22 |
| 44361.822916666664 | 269.36 |
| 44361.833333333336 | 216.76 |
| 44361.84375 | 195.17 |
| 44361.854166666664 | 449.19 |
| 44361.864583333336 | 256.97 |
| 44361.875 | 397.98 |
| 44361.885416666664 | 657.37 |
| 44361.895833333336 | 696.7 |
| 44361.90625 | 530.83 |
| 44361.916666666664 | 544.84 |
| 44361.927083333336 | 628.13 |
| 44361.9375 | 282.51 |
| 44361.947916666664 | 266.12 |
| 44361.958333333336 | 391.64 |
| 44361.96875 | 288.33 |
| 44361.979166666664 | 508.39 |
| 44361.989583333336 | 316.8 |
| 44362.0 | 487.85 |
| 44362.010416666664 | 402.25 |
| 44362.020833333336 | 461.07 |
| 44362.03125 | 528.81 |
| 44362.041666666664 | 318.51 |
| 44362.052083333336 | 376.84 |
| 44362.0625 | 377.19 |
| 44362.072916666664 | 264.49 |
| 44362.083333333336 | 455.11 |
| 44362.09375 | 298.34 |
| 44362.104166666664 | 276.62 |
| 44362.114583333336 | 293.17 |
| 44362.125 | 408.96 |
| 44362.135416666664 | 352.42 |
| 44362.145833333336 | 345.63 |
| 44362.15625 | 364.85 |
| 44362.166666666664 | 266.12 |
| 44362.177083333336 | 485.1 |
| 44362.1875 | 322.46 |
| 44362.197916666664 | 251.1 |
| 44362.208333333336 | 234.04 |
| 44362.21875 | 355.54 |
| 44362.229166666664 | 316.25 |
| 44362.239583333336 | 197.4 |
| 44362.25 | 184.53 |
| 44362.260416666664 | 165.46 |
| 44362.270833333336 | 187.02 |
| 44362.28125 | 260.25 |
| 44362.291666666664 | 218.62 |
| 44362.302083333336 | 189.88 |
| 44362.3125 | 209.36 |
| 44362.322916666664 | 200.81 |
| 44362.333333333336 | 214.26 |
| 44362.34375 | 239.11 |
| 44362.354166666664 | 253.18 |
| 44362.364583333336 | 229.77 |
| 44362.375 | 217.13 |
| 44362.385416666664 | 214.69 |
| 44362.395833333336 | 265.42 |
| 44362.40625 | 260.39 |
| 44362.416666666664 | 316.11 |
| 44362.427083333336 | 292.61 |
| 44362.4375 | 262.13 |
| 44362.447916666664 | 243.5 |
| 44362.458333333336 | 246.79 |
| 44362.46875 | 280.18 |
| 44362.479166666664 | 253.23 |
| 44362.489583333336 | 296.89 |
| 44362.5 | 270.84 |
| 44362.510416666664 | 300.21 |
| 44362.520833333336 | 297.33 |
| 44362.53125 | 286.25 |
| 44362.541666666664 | 366.2 |
| 44362.552083333336 | 531.23 |
| 44362.5625 | 541.5 |
| 44362.572916666664 | 836.03 |
| 44362.583333333336 | 785.2 |
| 44362.59375 | 788.89 |
| 44362.604166666664 | 500.77 |
| 44362.614583333336 | 810.49 |
| 44362.625 | 381.62 |
| 44362.635416666664 | 479.84 |
| 44362.645833333336 | 415.38 |
| 44362.65625 | 363.13 |
| 44362.666666666664 | 385.28 |
| 44362.677083333336 | 464.29 |
| 44362.6875 | 444.01 |
| 44362.697916666664 | 606.44 |
| 44362.708333333336 | 635.17 |
| 44362.71875 | 529.84 |
| 44362.729166666664 | 779.42 |
| 44362.739583333336 | 379.84 |
| 44362.75 | 327.3 |
| 44362.760416666664 | 396.12 |
| 44362.770833333336 | 515.05 |
| 44362.78125 | 459.81 |
| 44362.791666666664 | 543.33 |
| 44362.802083333336 | 437.53 |
| 44362.8125 | 542.67 |
| 44362.822916666664 | 549.57 |
| 44362.833333333336 | 596.37 |
| 44362.84375 | 398.24 |
| 44362.854166666664 | 454.85 |
| 44362.864583333336 | 506.79 |
| 44362.875 | 418.99 |
| 44362.885416666664 | 440.66 |
| 44362.895833333336 | 518.17 |
| 44362.90625 | 350.99 |
| 44362.916666666664 | 441.54 |
| 44362.927083333336 | 386.99 |
| 44362.9375 | 367.22 |
| 44362.947916666664 | 580.27 |
| 44362.958333333336 | 535.57 |
| 44362.96875 | 485.89 |
| 44362.979166666664 | 527.02 |
| 44362.989583333336 | 496.66 |
| 44363.0 | 460.37 |
| 44363.010416666664 | 506.73 |
| 44363.020833333336 | 434.35 |
| 44363.03125 | 377.65 |
| 44363.041666666664 | 608.79 |
| 44363.052083333336 | 552.41 |
| 44363.0625 | 699.06 |
| 44363.072916666664 | 715.6 |
| 44363.083333333336 | 713.49 |
| 44363.09375 | 811.06 |
| 44363.104166666664 | 833.96 |
| 44363.114583333336 | 801.53 |
| 44363.125 | 861.33 |
| 44363.135416666664 | 834.93 |
| 44363.145833333336 | 852.11 |
| 44363.15625 | 871.83 |
| 44363.166666666664 | 883.42 |
| 44363.177083333336 | 943.21 |
| 44363.1875 | 940.46 |
| 44363.197916666664 | 960.61 |
| 44363.208333333336 | 955.92 |
| 44363.21875 | 952.21 |
| 44363.229166666664 | 603.23 |
| 44363.239583333336 | 855.3 |
| 44363.25 | 1067.53 |
| 44363.260416666664 | 726.91 |
| 44363.270833333336 | 965.51 |
| 44363.28125 | 822.53 |
| 44363.291666666664 | 736.51 |
| 44363.302083333336 | 880.23 |
| 44363.3125 | 914.97 |
| 44363.322916666664 | 969.07 |
| 44363.333333333336 | 1003.21 |
| 44363.34375 | 921.74 |
| 44363.354166666664 | 929.29 |
| 44363.364583333336 | 816.91 |
| 44363.375 | 778.89 |
| 44363.385416666664 | 757.12 |
| 44363.395833333336 | 1011.96 |
| 44363.40625 | 748.02 |
| 44363.416666666664 | 908.81 |
| 44363.427083333336 | 853.99 |
| 44363.4375 | 1046.51 |
| 44363.447916666664 | 564.55 |
| 44363.458333333336 | 370.43 |
| 44363.46875 | 387.64 |
| 44363.479166666664 | 733.65 |
| 44363.489583333336 | 622.24 |
| 44363.5 | 506.16 |
| 44363.510416666664 | 451.84 |
| 44363.520833333336 | 466.49 |
| 44363.53125 | 658.12 |
| 44363.541666666664 | 578.69 |
| 44363.552083333336 | 694.24 |
| 44363.5625 | 363.35 |
| 44363.572916666664 | 637.96 |
| 44363.583333333336 | 580.78 |
| 44363.59375 | 650.72 |
| 44363.604166666664 | 731.75 |
| 44363.614583333336 | 729.97 |
| 44363.625 | 752.86 |
| 44363.635416666664 | 624.45 |
| 44363.645833333336 | 524.36 |
| 44363.65625 | 459.7 |
| 44363.666666666664 | 440.71 |
| 44363.677083333336 | 377.48 |
| 44363.6875 | 407.22 |
| 44363.697916666664 | 625.01 |
| 44363.708333333336 | 420.52 |
| 44363.71875 | 535.35 |
| 44363.729166666664 | 434.53 |
| 44363.739583333336 | 688.47 |
| 44363.75 | 654.89 |
| 44363.760416666664 | 644.14 |
| 44363.770833333336 | 644.26 |
| 44363.78125 | 852.6 |
| 44363.791666666664 | 538.64 |
| 44363.802083333336 | 972.04 |
| 44363.8125 | 770.48 |
| 44363.822916666664 | 494.97 |
| 44363.833333333336 | 505.49 |
| 44363.84375 | 609.26 |
| 44363.854166666664 | 957.31 |
| 44363.864583333336 | 607.69 |
| 44363.875 | 631.55 |
| 44363.885416666664 | 645.45 |
| 44363.895833333336 | 612.3 |
| 44363.90625 | 976.96 |
| 44363.916666666664 | 650.88 |
| 44363.927083333336 | 736.37 |
| 44363.9375 | 414.85 |
| 44363.947916666664 | 640.3 |
| 44363.958333333336 | 539.64 |
| 44363.96875 | 562.37 |
| 44363.979166666664 | 682.09 |
| 44363.989583333336 | 595.01 |
| 44364.0 | 726 |
| 44364.010416666664 | 499.97 |
| 44364.020833333336 | 686.42 |
| 44364.03125 | 755.65 |
| 44364.041666666664 | 487.25 |
| 44364.052083333336 | 628.59 |
| 44364.0625 | 679.5 |
| 44364.072916666664 | 861.52 |
| 44364.083333333336 | 770.87 |
| 44364.09375 | 1059.37 |
| 44364.104166666664 | 1015.8 |
| 44364.114583333336 | 684.37 |
| 44364.125 | 694.78 |
| 44364.135416666664 | 974.86 |
| 44364.145833333336 | 844.5 |
| 44364.15625 | 600.96 |
| 44364.166666666664 | 675.69 |
| 44364.177083333336 | 624.34 |
| 44364.1875 | 884.79 |
| 44364.197916666664 | 689.1 |
| 44364.208333333336 | 747.91 |
| 44364.21875 | 682.95 |
| 44364.229166666664 | 744.4 |
| 44364.239583333336 | 661.51 |
| 44364.25 | 367.71 |
| 44364.260416666664 | 350.08 |
| 44364.270833333336 | 764.52 |
| 44364.28125 | 1069.77 |
| 44364.291666666664 | 1042.75 |
| 44364.302083333336 | 707.11 |
| 44364.3125 | 1252.13 |
| 44364.322916666664 | 916.4 |
| 44364.333333333336 | 729.72 |
| 44364.34375 | 999.14 |
| 44364.354166666664 | 665.33 |
| 44364.364583333336 | 1146.65 |
| 44364.375 | 875.4 |
| 44364.385416666664 | 621.58 |
| 44364.395833333336 | 1239.11 |
| 44364.40625 | 1324.08 |
| 44364.416666666664 | 964.08 |
| 44364.427083333336 | 1198.13 |
| 44364.4375 | 895.11 |
| 44364.447916666664 | 744.33 |
| 44364.458333333336 | 564.99 |
| 44364.46875 | 683.63 |
| 44364.479166666664 | 765.4 |
| 44364.489583333336 | 751.09 |
| 44364.5 | 1211.01 |
| 44364.510416666664 | 789.59 |
| 44364.520833333336 | 888.73 |
| 44364.53125 | 959.56 |
| 44364.541666666664 | 1241.23 |
| 44364.552083333336 | 1122.62 |
| 44364.5625 | 774.36 |
| 44364.572916666664 | 610.18 |
| 44364.583333333336 | 590.55 |
| 44364.59375 | 1169.68 |
| 44364.604166666664 | 1200.65 |
| 44364.614583333336 | 1112.31 |
| 44364.625 | 1017.84 |
| 44364.635416666664 | 763.92 |
| 44364.645833333336 | 666.95 |
| 44364.65625 | 690.72 |
| 44364.666666666664 | 589.44 |
| 44364.677083333336 | 604.83 |
| 44364.6875 | 591.16 |
| 44364.697916666664 | 700.07 |
| 44364.708333333336 | 544.97 |
| 44364.71875 | 768.17 |
| 44364.729166666664 | 863.52 |
| 44364.739583333336 | 829.89 |
| 44364.75 | 863.71 |
| 44364.760416666664 | 742.82 |
| 44364.770833333336 | 23.79 |
| 44364.78125 | 19.88 |
| 44364.791666666664 | 19.51 |
| 44364.802083333336 | 17.68 |
| 44364.8125 | 17.29 |
| 44364.822916666664 | 17.46 |
| 44364.833333333336 | 19.79 |
| 44364.84375 | 20.66 |
| 44364.854166666664 | 25.78 |
| 44364.864583333336 | 24.57 |
| 44364.875 | 24.12 |
| 44364.885416666664 | 27.05 |
| 44364.895833333336 | 22.15 |
| 44364.90625 | 26.31 |
| 44364.916666666664 | 27.15 |
| 44364.927083333336 | 29.19 |
| 44364.9375 | 26.78 |
| 44364.947916666664 | 28.19 |
| 44364.958333333336 | 26.02 |
| 44364.96875 | 25.14 |
| 44364.979166666664 | 21.91 |
| 44364.989583333336 | 20.99 |
| 44365.0 | 19.84 |
| 44365.010416666664 | 19 |
| 44365.020833333336 | 18.25 |
| 44365.03125 | 17.46 |
| 44365.041666666664 | 16.64 |
| 44365.052083333336 | 17.01 |
| 44365.0625 | 17.04 |
| 44365.072916666664 | 19.7 |
| 44365.083333333336 | 19.68 |
| 44365.09375 | 21.26 |
| 44365.104166666664 | 21.03 |
| 44365.114583333336 | 23.78 |
| 44365.125 | 24.03 |
| 44365.135416666664 | 22.79 |
| 44365.145833333336 | 24.06 |
| 44365.15625 | 24.62 |
| 44365.166666666664 | 24.06 |
| 44365.177083333336 | 20.07 |
| 44365.1875 | 23.86 |
| 44365.197916666664 | 24.01 |
| 44365.208333333336 | 23.7 |
| 44365.21875 | 22.5 |
| 44365.229166666664 | 20.62 |
| 44365.239583333336 | 21.51 |
| 44365.25 | 20.44 |
| 44365.260416666664 | 20.82 |
| 44365.270833333336 | 18.1 |
| 44365.28125 | 18.5 |
| 44365.291666666664 | 13.7 |
| 44365.302083333336 | 15.41 |
| 44365.3125 | 17.71 |
| 44365.322916666664 | 15.86 |
| 44365.333333333336 | 18.66 |
| 44365.34375 | 18.99 |
| 44365.354166666664 | 20.5 |
| 44365.364583333336 | 22.71 |
| 44365.375 | 23.24 |
| 44365.385416666664 | 26.09 |
| 44365.395833333336 | 25.76 |
| 44365.40625 | 23.99 |
| 44365.416666666664 | 26.19 |
| 44365.427083333336 | 33.73 |
| 44365.4375 | 29.33 |
| 44365.447916666664 | 26.99 |
| 44365.458333333336 | 26.57 |
| 44365.46875 | 24.08 |
| 44365.479166666664 | 21.67 |
| 44365.489583333336 | 19.04 |
| 44365.5 | 18.2 |
| 44365.510416666664 | 18.97 |
| 44365.520833333336 | 20.36 |
| 44365.53125 | 17.78 |
| 44365.541666666664 | 20.55 |
| 44365.552083333336 | 17.39 |
| 44365.5625 | 16.86 |
| 44365.572916666664 | 17.59 |
| 44365.583333333336 | 18.12 |
| 44365.59375 | 20.58 |
| 44365.604166666664 | 19.13 |
| 44365.614583333336 | 22.22 |
| 44365.625 | 22.22 |
| 44365.635416666664 | 23.41 |
| 44365.645833333336 | 24.08 |
| 44365.65625 | 24.01 |
| 44365.666666666664 | 25.49 |
| 44365.677083333336 | 25.29 |
| 44365.6875 | 25.69 |
| 44365.697916666664 | 23.9 |
| 44365.708333333336 | 25.72 |
| 44365.71875 | 26.04 |
| 44365.729166666664 | 26.26 |
| 44365.739583333336 | 25.71 |
| 44365.75 | 26.33 |
| 44365.760416666664 | 27.49 |
| 44365.770833333336 | 24.77 |
| 44365.78125 | 25.18 |
| 44365.791666666664 | 24.91 |
| 44365.802083333336 | 22.62 |
| 44365.8125 | 22.72 |
| 44365.822916666664 | 21.9 |
| 44365.833333333336 | 20.99 |
| 44365.84375 | 18.95 |
| 44365.854166666664 | 23.63 |
| 44365.864583333336 | 20.96 |
| 44365.875 | 22.08 |
| 44365.885416666664 | 23.48 |
| 44365.895833333336 | 26.84 |
| 44365.90625 | 25.89 |
| 44365.916666666664 | 26.54 |
| 44365.927083333336 | 26.96 |
| 44365.9375 | 30.27 |
| 44365.947916666664 | 30.44 |
| 44365.958333333336 | 28.73 |
| 44365.96875 | 29.46 |
| 44365.979166666664 | 25.3 |
| 44365.989583333336 | 24.63 |
| 44366.0 | 21.66 |
| 44366.010416666664 | 20.94 |
| 44366.020833333336 | 21 |
| 44366.03125 | 20.25 |
| 44366.041666666664 | 19.43 |
| 44366.052083333336 | 18.74 |
| 44366.0625 | 18.27 |
| 44366.072916666664 | 17.53 |
| 44366.083333333336 | 16.26 |
| 44366.09375 | 18.51 |
| 44366.104166666664 | 17.87 |
| 44366.114583333336 | 20.62 |
| 44366.125 | 20.99 |
| 44366.135416666664 | 22.9 |
| 44366.145833333336 | 23.31 |
| 44366.15625 | 26.85 |
| 44366.166666666664 | 31.34 |
| 44366.177083333336 | 32.63 |
| 44366.1875 | 37.6 |
| 44366.197916666664 | 36.9 |
| 44366.208333333336 | 42.27 |
| 44366.21875 | 37.45 |
| 44366.229166666664 | 35.82 |
| 44366.239583333336 | 33.53 |
| 44366.25 | 30.27 |
| 44366.260416666664 | 29.48 |
| 44366.270833333336 | 27.43 |
| 44366.28125 | 26.4 |
| 44366.291666666664 | 26.63 |
| 44366.302083333336 | 25.24 |
| 44366.3125 | 24.33 |
| 44366.322916666664 | 21.26 |
| 44366.333333333336 | 21.6 |
| 44366.34375 | 21.27 |
| 44366.354166666664 | 18.5 |
| 44366.364583333336 | 19.67 |
| 44366.375 | 19.52 |
| 44366.385416666664 | 19.88 |
| 44366.395833333336 | 18.01 |
| 44366.40625 | 22.39 |
| 44366.416666666664 | 25.66 |
| 44366.427083333336 | 27.44 |
| 44366.4375 | 31.22 |
| 44366.447916666664 | 31.94 |
| 44366.458333333336 | 29.47 |
| 44366.46875 | 26.01 |
| 44366.479166666664 | 27.14 |
| 44366.489583333336 | 25.98 |
| 44366.5 | 26.14 |
| 44366.510416666664 | 25.37 |
| 44366.520833333336 | 23.83 |
| 44366.53125 | 24.51 |
| 44366.541666666664 | 23.29 |
| 44366.552083333336 | 24.57 |
| 44366.5625 | 24.82 |
| 44366.572916666664 | 27.75 |
| 44366.583333333336 | 25.7 |
| 44366.59375 | 25.28 |
| 44366.604166666664 | 20.31 |
| 44366.614583333336 | 23.34 |
| 44366.625 | 24.04 |
| 44366.635416666664 | 22.58 |
| 44366.645833333336 | 23.19 |
| 44366.65625 | 27.04 |
| 44366.666666666664 | 28.85 |
| 44366.677083333336 | 32.25 |
| 44366.6875 | 34.38 |
| 44366.697916666664 | 36.62 |
| 44366.708333333336 | 35.06 |
| 44366.71875 | 29.94 |
| 44366.729166666664 | 31.63 |
| 44366.739583333336 | 32.97 |
| 44366.75 | 32.24 |
| 44366.760416666664 | 33.06 |
| 44366.770833333336 | 31.99 |
| 44366.78125 | 32.06 |
| 44366.791666666664 | 32.14 |
| 44366.802083333336 | 28.22 |
| 44366.8125 | 29.2 |
| 44366.822916666664 | 26.91 |
| 44366.833333333336 | 26.75 |
| 44366.84375 | 23.67 |
| 44366.854166666664 | 21.92 |
| 44366.864583333336 | 17.73 |
| 44366.875 | 24.53 |
| 44366.885416666664 | 13.45 |
| 44366.895833333336 | 21.1 |
| 44366.90625 | 13.91 |
| 44366.916666666664 | 18.06 |
| 44366.927083333336 | 20 |
| 44366.9375 | 23.26 |
| 44366.947916666664 | 29.08 |
| 44366.958333333336 | 34.26 |
| 44366.96875 | 31.08 |
| 44366.979166666664 | 21.99 |
| 44366.989583333336 | 27.06 |
| 44367.0 | 30.55 |
| 44367.010416666664 | 32.64 |
| 44367.020833333336 | 33.09 |
| 44367.03125 | 33.13 |
| 44367.041666666664 | 29.26 |
| 44367.052083333336 | 24.82 |
| 44367.0625 | 24.25 |
| 44367.072916666664 | 22.12 |
| 44367.083333333336 | 18.79 |
| 44367.09375 | 15.16 |
| 44367.104166666664 | 16.44 |
| 44367.114583333336 | 15.16 |
| 44367.125 | 15.65 |
| 44367.135416666664 | 17.26 |
| 44367.145833333336 | 18.56 |
| 44367.15625 | 22.6 |
| 44367.166666666664 | 21.55 |
| 44367.177083333336 | 22.78 |
| 44367.1875 | 24.05 |
| 44367.197916666664 | 24.37 |
| 44367.208333333336 | 25.49 |
| 44367.21875 | 25.93 |
| 44367.229166666664 | 26.62 |
| 44367.239583333336 | 25.1 |
| 44367.25 | 26.39 |
| 44367.260416666664 | 24.58 |
| 44367.270833333336 | 26.36 |
| 44367.28125 | 25.87 |
| 44367.291666666664 | 27.8 |
| 44367.302083333336 | 28.06 |
| 44367.3125 | 26.23 |
| 44367.322916666664 | 24.28 |
| 44367.333333333336 | 22.36 |
| 44367.34375 | 22.66 |
| 44367.354166666664 | 19.72 |
| 44367.364583333336 | 17.64 |
| 44367.375 | 15.4 |
| 44367.385416666664 | 17.93 |
| 44367.395833333336 | 19.92 |
| 44367.40625 | 18.33 |
| 44367.416666666664 | 19.63 |
| 44367.427083333336 | 18.05 |
| 44367.4375 | 24.9 |
| 44367.447916666664 | 19.78 |
| 44367.458333333336 | 21.4 |
| 44367.46875 | 27.39 |
| 44367.479166666664 | 28.54 |
| 44367.489583333336 | 28.24 |
| 44367.5 | 27.83 |
| 44367.510416666664 | 27.63 |
| 44367.520833333336 | 31.6 |
| 44367.53125 | 29.74 |
| 44367.541666666664 | 26.13 |
| 44367.552083333336 | 25.81 |
| 44367.5625 | 25.03 |
| 44367.572916666664 | 23.13 |
| 44367.583333333336 | 21.5 |
| 44367.59375 | 21.86 |
| 44367.604166666664 | 22.86 |
| 44367.614583333336 | 25.07 |
| 44367.625 | 18.68 |
| 44367.635416666664 | 18.74 |
| 44367.645833333336 | 22.11 |
| 44367.65625 | 23.93 |
| 44367.666666666664 | 24.52 |
| 44367.677083333336 | 24.11 |
| 44367.6875 | 26.75 |
| 44367.697916666664 | 30.13 |
| 44367.708333333336 | 32.08 |
| 44367.71875 | 35.23 |
| 44367.729166666664 | 36.85 |
| 44367.739583333336 | 36.36 |
| 44367.75 | 38.09 |
| 44367.760416666664 | 39.28 |
| 44367.770833333336 | 45.91 |
| 44367.78125 | 49.89 |
| 44367.791666666664 | 49.91 |
| 44367.802083333336 | 56.22 |
| 44367.8125 | 50.88 |
| 44367.822916666664 | 47.07 |
| 44367.833333333336 | 45.49 |
| 44367.84375 | 45.4 |
| 44367.854166666664 | 42.43 |
| 44367.864583333336 | 44.14 |
| 44367.875 | 40.01 |
| 44367.885416666664 | 35.37 |
| 44367.895833333336 | 28.39 |
| 44367.90625 | 25.69 |
| 44367.916666666664 | 21.21 |
| 44367.927083333336 | 24.1 |
| 44367.9375 | 20.52 |
| 44367.947916666664 | 21.32 |
| 44367.958333333336 | 21.46 |
| 44367.96875 | 24.36 |
| 44367.979166666664 | 24.88 |
| 44367.989583333336 | 28.56 |
| 44368.0 | 32.12 |
| 44368.010416666664 | 33.84 |
| 44368.020833333336 | 37.72 |
| 44368.03125 | 29.25 |
| 44368.041666666664 | 33.7 |
| 44368.052083333336 | 42.12 |
| 44368.0625 | 35.12 |
| 44368.072916666664 | 38.13 |
| 44368.083333333336 | 38.13 |
| 44368.09375 | 35.31 |
| 44368.104166666664 | 32.68 |
| 44368.114583333336 | 27.55 |
| 44368.125 | 22.71 |
| 44368.135416666664 | 21.22 |
| 44368.145833333336 | 21.32 |
| 44368.15625 | 18.75 |
| 44368.166666666664 | 17.77 |
| 44368.177083333336 | 21.7 |
| 44368.1875 | 23.03 |
| 44368.197916666664 | 24.18 |
| 44368.208333333336 | 23.32 |
| 44368.21875 | 24.95 |
| 44368.229166666664 | 26 |
| 44368.239583333336 | 30.34 |
| 44368.25 | 31.82 |
| 44368.260416666664 | 32.05 |
| 44368.270833333336 | 34.82 |
| 44368.28125 | 35.47 |
| 44368.291666666664 | 39.14 |
| 44368.302083333336 | 41.33 |
| 44368.3125 | 35.94 |
| 44368.322916666664 | 37.6 |
| 44368.333333333336 | 34.97 |
| 44368.34375 | 34.7 |
| 44368.354166666664 | 32.07 |
| 44368.364583333336 | 30.75 |
| 44368.375 | 29.99 |
| 44368.385416666664 | 26.01 |
| 44368.395833333336 | 23.08 |
| 44368.40625 | 22.54 |
| 44368.416666666664 | 22.41 |
| 44368.427083333336 | 18.94 |
| 44368.4375 | 20.96 |
| 44368.447916666664 | 20.53 |
| 44368.458333333336 | 18.34 |
| 44368.46875 | 18.98 |
| 44368.479166666664 | 19.91 |
| 44368.489583333336 | 23.66 |
| 44368.5 | 24.31 |
| 44368.510416666664 | 27.6 |
| 44368.520833333336 | 28.64 |
| 44368.53125 | 28.22 |
| 44368.541666666664 | 31.22 |
| 44368.552083333336 | 34.36 |
| 44368.5625 | 33.83 |
| 44368.572916666664 | 31.63 |
| 44368.583333333336 | 32.76 |
| 44368.59375 | 31.34 |
| 44368.604166666664 | 28.67 |
| 44368.614583333336 | 28.43 |
| 44368.625 | 29.99 |
| 44368.635416666664 | 25.92 |
| 44368.645833333336 | 28.05 |
| 44368.65625 | 23.46 |
| 44368.666666666664 | 21.91 |
| 44368.677083333336 | 24.36 |
| 44368.6875 | 27.53 |
| 44368.697916666664 | 25.39 |
| 44368.708333333336 | 26.56 |
| 44368.71875 | 26.6 |
| 44368.729166666664 | 31.85 |
| 44368.739583333336 | 33.99 |
| 44368.75 | 35.02 |
| 44368.760416666664 | 36.55 |
| 44368.770833333336 | 33.38 |
| 44368.78125 | 34.67 |
| 44368.791666666664 | 35.53 |
| 44368.802083333336 | 35.55 |
| 44368.8125 | 34.98 |
| 44368.822916666664 | 34.53 |
| 44368.833333333336 | 33.93 |
| 44368.84375 | 33.33 |
| 44368.854166666664 | 34.74 |
| 44368.864583333336 | 34.12 |
| 44368.875 | 33.39 |
| 44368.885416666664 | 32.17 |
| 44368.895833333336 | 31.92 |
| 44368.90625 | 29.52 |
| 44368.916666666664 | 29.84 |
| 44368.927083333336 | 25.78 |
| 44368.9375 | 24.29 |
| 44368.947916666664 | 22.74 |
| 44368.958333333336 | 23.06 |
| 44368.96875 | 16.94 |
| 44368.979166666664 | 20.88 |
| 44368.989583333336 | 17.83 |
| 44369.0 | 16.85 |
| 44369.010416666664 | 20.31 |
| 44369.020833333336 | 23.21 |
| 44369.03125 | 23.29 |
| 44369.041666666664 | 24.5 |
| 44369.052083333336 | 27.36 |
| 44369.0625 | 32.65 |
| 44369.072916666664 | 39.91 |
| 44369.083333333336 | 40.25 |
| 44369.09375 | 37.73 |
| 44369.104166666664 | 41.22 |
| 44369.114583333336 | 62.54 |
| 44369.125 | 63.64 |
| 44369.135416666664 | 57.57 |
| 44369.145833333336 | 55.53 |
| 44369.15625 | 45.04 |
| 44369.166666666664 | 37.75 |
| 44369.177083333336 | 31.41 |
| 44369.1875 | 27.43 |
| 44369.197916666664 | 21.88 |
| 44369.208333333336 | 21.14 |
| 44369.21875 | 18.75 |
| 44369.229166666664 | 22.42 |
| 44369.239583333336 | 23.22 |
| 44369.25 | 23.69 |
| 44369.260416666664 | 24.59 |
| 44369.270833333336 | 24.93 |
| 44369.28125 | 27.92 |
| 44369.291666666664 | 28.95 |
| 44369.302083333336 | 30.83 |
| 44369.3125 | 31.35 |
| 44369.322916666664 | 34.13 |
| 44369.333333333336 | 34.7 |
| 44369.34375 | 35.76 |
| 44369.354166666664 | 34.58 |
| 44369.364583333336 | 35.1 |
| 44369.375 | 33.74 |
| 44369.385416666664 | 31.33 |
| 44369.395833333336 | 33.11 |
| 44369.40625 | 29.91 |
| 44369.416666666664 | 30.65 |
| 44369.427083333336 | 29.06 |
| 44369.4375 | 30.66 |
| 44369.447916666664 | 26.33 |
| 44369.458333333336 | 20.24 |
| 44369.46875 | 24.04 |
| 44369.479166666664 | 22.31 |
| 44369.489583333336 | 21.84 |
| 44369.5 | 21.9 |
| 44369.510416666664 | 29.07 |
| 44369.520833333336 | 24.53 |
| 44369.53125 | 26.55 |
| 44369.541666666664 | 29.55 |
| 44369.552083333336 | 29.11 |
| 44369.5625 | 33.51 |
| 44369.572916666664 | 36.87 |
| 44369.583333333336 | 31.85 |
| 44369.59375 | 36.27 |
| 44369.604166666664 | 38.22 |
| 44369.614583333336 | 43.91 |
| 44369.625 | 39.41 |
| 44369.635416666664 | 45.31 |
| 44369.645833333336 | 38.2 |
| 44369.65625 | 38.77 |
| 44369.666666666664 | 40.05 |
| 44369.677083333336 | 29.56 |
| 44369.6875 | 23.99 |
| 44369.697916666664 | 24.12 |
| 44369.708333333336 | 22.26 |
| 44369.71875 | 24.4 |
| 44369.729166666664 | 28.09 |
| 44369.739583333336 | 32.43 |
| 44369.75 | 32.95 |
| 44369.760416666664 | 33.76 |
| 44369.770833333336 | 36.83 |
| 44369.78125 | 42.34 |
| 44369.791666666664 | 39.79 |
| 44369.802083333336 | 43.73 |
| 44369.8125 | 51.51 |
| 44369.822916666664 | 56.47 |
| 44369.833333333336 | 61.07 |
| 44369.84375 | 58.46 |
| 44369.854166666664 | 57.91 |
| 44369.864583333336 | 56.03 |
| 44369.875 | 52.67 |
| 44369.885416666664 | 47.59 |
| 44369.895833333336 | 49.73 |
| 44369.90625 | 45.14 |
| 44369.916666666664 | 42.72 |
| 44369.927083333336 | 37.25 |
| 44369.9375 | 34.79 |
| 44369.947916666664 | 29.8 |
| 44369.958333333336 | 31.61 |
| 44369.96875 | 28.09 |
| 44369.979166666664 | 29.95 |
| 44369.989583333336 | 29.71 |
| 44370.0 | 29.21 |
| 44370.010416666664 | 22.87 |
| 44370.020833333336 | 22.44 |
| 44370.03125 | 25.22 |
| 44370.041666666664 | 21.63 |
| 44370.052083333336 | 22.82 |
| 44370.0625 | 25.67 |
| 44370.072916666664 | 27.91 |
| 44370.083333333336 | 43.97 |
| 44370.09375 | 32.83 |
| 44370.104166666664 | 43.73 |
| 44370.114583333336 | 60.03 |
| 44370.125 | 33.79 |
| 44370.135416666664 | 65.6 |
| 44370.145833333336 | 70.43 |
| 44370.15625 | 52.09 |
| 44370.166666666664 | 70.87 |
| 44370.177083333336 | 73.93 |
| 44370.1875 | 79.35 |
| 44370.197916666664 | 57.91 |
| 44370.208333333336 | 62.03 |
| 44370.21875 | 54.08 |
| 44370.229166666664 | 47.38 |
| 44370.239583333336 | 40.16 |
| 44370.25 | 33.38 |
| 44370.260416666664 | 28.63 |
| 44370.270833333336 | 27.69 |
| 44370.28125 | 34.08 |
| 44370.291666666664 | 37.86 |
| 44370.302083333336 | 37.48 |
| 44370.3125 | 41.3 |
| 44370.322916666664 | 38.89 |
| 44370.333333333336 | 40.97 |
| 44370.34375 | 38.74 |
| 44370.354166666664 | 34.47 |
| 44370.364583333336 | 32.79 |
| 44370.375 | 31.18 |
| 44370.385416666664 | 27.94 |
| 44370.395833333336 | 29.51 |
| 44370.40625 | 28.61 |
| 44370.416666666664 | 30.26 |
| 44370.427083333336 | 28.66 |
| 44370.4375 | 27.33 |
| 44370.447916666664 | 29.89 |
| 44370.458333333336 | 29 |
| 44370.46875 | 33.08 |
| 44370.479166666664 | 29.56 |
| 44370.489583333336 | 28.54 |
| 44370.5 | 27.12 |
| 44370.510416666664 | 23.15 |
| 44370.520833333336 | 19.13 |
| 44370.53125 | 20.75 |
| 44370.541666666664 | 20.28 |
| 44370.552083333336 | 24.82 |
| 44370.5625 | 32.27 |
| 44370.572916666664 | 38.81 |
| 44370.583333333336 | 24.72 |
| 44370.59375 | 37.67 |
| 44370.604166666664 | 40.11 |
| 44370.614583333336 | 51.92 |
| 44370.625 | 65.7 |
| 44370.635416666664 | 51.79 |
| 44370.645833333336 | 54.67 |
| 44370.65625 | 50.05 |
| 44370.666666666664 | 46.01 |
| 44370.677083333336 | 45.33 |
| 44370.6875 | 40.09 |
| 44370.697916666664 | 39.8 |
| 44370.708333333336 | 37.51 |
| 44370.71875 | 35.55 |
| 44370.729166666664 | 34.32 |
| 44370.739583333336 | 32.58 |
| 44370.75 | 30 |
| 44370.760416666664 | 26.72 |
| 44370.770833333336 | 23.56 |
| 44370.78125 | 29.56 |
| 44370.791666666664 | 31.89 |
| 44370.802083333336 | 33.14 |
| 44370.8125 | 34.49 |
| 44370.822916666664 | 34.95 |
| 44370.833333333336 | 37.16 |
| 44370.84375 | 42.47 |
| 44370.854166666664 | 45.6 |
| 44370.864583333336 | 46.39 |
| 44370.875 | 43.21 |
| 44370.885416666664 | 41.82 |
| 44370.895833333336 | 40.88 |
| 44370.90625 | 42.54 |
| 44370.916666666664 | 37.45 |
| 44370.927083333336 | 37.37 |
| 44370.9375 | 36.2 |
| 44370.947916666664 | 34.79 |
| 44370.958333333336 | 32.33 |
| 44370.96875 | 30.17 |
| 44370.979166666664 | 28.18 |
| 44370.989583333336 | 25.75 |
| 44371.0 | 25.77 |
| 44371.010416666664 | 23.48 |
| 44371.020833333336 | 22.74 |
| 44371.03125 | 19.29 |
| 44371.041666666664 | 20.21 |
| 44371.052083333336 | 19.95 |
| 44371.0625 | 18.34 |
| 44371.072916666664 | 17.49 |
| 44371.083333333336 | 17.22 |
| 44371.09375 | 20.67 |
| 44371.104166666664 | 20.75 |
| 44371.114583333336 | 24.11 |
| 44371.125 | 25.86 |
| 44371.135416666664 | 24.24 |
| 44371.145833333336 | 30.8 |
| 44371.15625 | 31.13 |
| 44371.166666666664 | 23.39 |
| 44371.177083333336 | 29.38 |
| 44371.1875 | 36.72 |
| 44371.197916666664 | 55.45 |
| 44371.208333333336 | 52.04 |
| 44371.21875 | 64.79 |
| 44371.229166666664 | 74.75 |
| 44371.239583333336 | 64.42 |
| 44371.25 | 63.36 |
| 44371.260416666664 | 48.3 |
| 44371.270833333336 | 42.97 |
| 44371.28125 | 40.93 |
| 44371.291666666664 | 29.05 |
| 44371.302083333336 | 21.8 |
| 44371.3125 | 26.72 |
| 44371.322916666664 | 24.76 |
| 44371.333333333336 | 27.16 |
| 44371.34375 | 28.89 |
| 44371.354166666664 | 29.69 |
| 44371.364583333336 | 31.46 |
| 44371.375 | 37.85 |
| 44371.385416666664 | 36.42 |
| 44371.395833333336 | 35.35 |
| 44371.40625 | 33.84 |
| 44371.416666666664 | 33.25 |
| 44371.427083333336 | 33.67 |
| 44371.4375 | 33.33 |
| 44371.447916666664 | 34.03 |
| 44371.458333333336 | 34.53 |
| 44371.46875 | 34.64 |
| 44371.479166666664 | 33.55 |
| 44371.489583333336 | 32.62 |
| 44371.5 | 30.74 |
| 44371.510416666664 | 26.8 |
| 44371.520833333336 | 43 |
| 44371.53125 | 22.08 |
| 44371.541666666664 | 21.91 |
| 44371.552083333336 | 18.39 |
| 44371.5625 | 20.93 |
| 44371.572916666664 | 21.75 |
| 44371.583333333336 | 27.17 |
| 44371.59375 | 29.29 |
| 44371.604166666664 | 30.66 |
| 44371.614583333336 | 32.95 |
| 44371.625 | 31.02 |
| 44371.635416666664 | 39.6 |
| 44371.645833333336 | 51.21 |
| 44371.65625 | 59.67 |
| 44371.666666666664 | 51.85 |
| 44371.677083333336 | 67.03 |
| 44371.6875 | 67.06 |
| 44371.697916666664 | 57.39 |
| 44371.708333333336 | 48.99 |
| 44371.71875 | 59.51 |
| 44371.729166666664 | 50.32 |
| 44371.739583333336 | 51.54 |
| 44371.75 | 50.26 |
| 44371.760416666664 | 42.75 |
| 44371.770833333336 | 45.21 |
| 44371.78125 | 48.2 |
| 44371.791666666664 | 35.91 |
| 44371.802083333336 | 31.38 |
| 44371.8125 | 30.88 |
| 44371.822916666664 | 31.63 |
| 44371.833333333336 | 32.72 |
| 44371.84375 | 32.31 |
| 44371.854166666664 | 32.76 |
| 44371.864583333336 | 32.5 |
| 44371.875 | 37.6 |
| 44371.885416666664 | 37.67 |
| 44371.895833333336 | 41.04 |
| 44371.90625 | 41.53 |
| 44371.916666666664 | 42.59 |
| 44371.927083333336 | 41.84 |
| 44371.9375 | 44.87 |
| 44371.947916666664 | 43.94 |
| 44371.958333333336 | 44.56 |
| 44371.96875 | 40.88 |
| 44371.979166666664 | 38.2 |
| 44371.989583333336 | 35.71 |
| 44372.0 | 33.61 |
| 44372.010416666664 | 31.73 |
| 44372.020833333336 | 29.66 |
| 44372.03125 | 26.15 |
| 44372.041666666664 | 24.67 |
| 44372.052083333336 | 24.12 |
| 44372.0625 | 22.24 |
| 44372.072916666664 | 19.69 |
| 44372.083333333336 | 17.87 |
| 44372.09375 | 17.69 |
| 44372.104166666664 | 19.06 |
| 44372.114583333336 | 17.73 |
| 44372.125 | 16.36 |
| 44372.135416666664 | 20.79 |
| 44372.145833333336 | 21.11 |
| 44372.15625 | 19.5 |
| 44372.166666666664 | 23.08 |
| 44372.177083333336 | 22.39 |
| 44372.1875 | 28.65 |
| 44372.197916666664 | 24.61 |
| 44372.208333333336 | 24.39 |
| 44372.21875 | 35.28 |
| 44372.229166666664 | 44.64 |
| 44372.239583333336 | 48.72 |
| 44372.25 | 49.56 |
| 44372.260416666664 | 69.28 |
| 44372.270833333336 | 71.43 |
| 44372.28125 | 48.6 |
| 44372.291666666664 | 57.43 |
| 44372.302083333336 | 50.56 |
| 44372.3125 | 40.95 |
| 44372.322916666664 | 36.2 |
| 44372.333333333336 | 29.52 |
| 44372.34375 | 23.85 |
| 44372.354166666664 | 25.03 |
| 44372.364583333336 | 25.49 |
| 44372.375 | 28.02 |
| 44372.385416666664 | 28.16 |
| 44372.395833333336 | 28.77 |
| 44372.40625 | 28.2 |
| 44372.416666666664 | 31.31 |
| 44372.427083333336 | 31.88 |
| 44372.4375 | 32.82 |
| 44372.447916666664 | 33.15 |
| 44372.458333333336 | 34.98 |
| 44372.46875 | 35.66 |
| 44372.479166666664 | 35.68 |
| 44372.489583333336 | 35.21 |
| 44372.5 | 35.52 |
| 44372.510416666664 | 36.53 |
| 44372.520833333336 | 33.3 |
| 44372.53125 | 27.73 |
| 44372.541666666664 | 28.89 |
| 44372.552083333336 | 24.53 |
| 44372.5625 | 21.54 |
| 44372.572916666664 | 20.16 |
| 44372.583333333336 | 18.58 |
| 44372.59375 | 15.81 |
| 44372.604166666664 | 16.85 |
| 44372.614583333336 | 17.72 |
| 44372.625 | 23.67 |
| 44372.635416666664 | 20.6 |
| 44372.645833333336 | 28.66 |
| 44372.65625 | 29.8 |
| 44372.666666666664 | 28.45 |
| 44372.677083333336 | 37.64 |
| 44372.6875 | 35.5 |
| 44372.697916666664 | 40.41 |
| 44372.708333333336 | 44.75 |
| 44372.71875 | 40.59 |
| 44372.729166666664 | 51.88 |
| 44372.739583333336 | 49.03 |
| 44372.75 | 39.35 |
| 44372.760416666664 | 36.34 |
| 44372.770833333336 | 39.67 |
| 44372.78125 | 33.61 |
| 44372.791666666664 | 33.27 |
| 44372.802083333336 | 33.59 |
| 44372.8125 | 29.45 |
| 44372.822916666664 | 24.62 |
| 44372.833333333336 | 23.93 |
| 44372.84375 | 24.58 |
| 44372.854166666664 | 26.72 |
| 44372.864583333336 | 31.79 |
| 44372.875 | 32.03 |
| 44372.885416666664 | 30.7 |
| 44372.895833333336 | 39.87 |
| 44372.90625 | 36.19 |
| 44372.916666666664 | 37.34 |
| 44372.927083333336 | 37.5 |
| 44372.9375 | 37.08 |
| 44372.947916666664 | 37.37 |
| 44372.958333333336 | 37.61 |
| 44372.96875 | 36.79 |
| 44372.979166666664 | 38.35 |
| 44372.989583333336 | 36.19 |
| 44373.0 | 34.81 |
| 44373.010416666664 | 33.64 |
| 44373.020833333336 | 32.87 |
| 44373.03125 | 32.41 |
| 44373.041666666664 | 28.96 |
| 44373.052083333336 | 26.37 |
| 44373.0625 | 23.95 |
| 44373.072916666664 | 21.51 |
| 44373.083333333336 | 18.77 |
| 44373.09375 | 19.63 |
| 44373.104166666664 | 19.43 |
| 44373.114583333336 | 16.46 |
| 44373.125 | 17.8 |
| 44373.135416666664 | 16.06 |
| 44373.145833333336 | 17.1 |
| 44373.15625 | 17.13 |
| 44373.166666666664 | 17.07 |
| 44373.177083333336 | 21.05 |
| 44373.1875 | 22.79 |
| 44373.197916666664 | 25.56 |
| 44373.208333333336 | 26.92 |
| 44373.21875 | 24.45 |
| 44373.229166666664 | 28.42 |
| 44373.239583333336 | 34.4 |
| 44373.25 | 36.61 |
| 44373.260416666664 | 35.93 |
| 44373.270833333336 | 40.3 |
| 44373.28125 | 55.85 |
| 44373.291666666664 | 51.9 |
| 44373.302083333336 | 54.33 |
| 44373.3125 | 47.93 |
| 44373.322916666664 | 45.69 |
| 44373.333333333336 | 39.12 |
| 44373.34375 | 36.61 |
| 44373.354166666664 | 31.3 |
| 44373.364583333336 | 25.72 |
| 44373.375 | 24.06 |
| 44373.385416666664 | 22.9 |
| 44373.395833333336 | 43.18 |
| 44373.40625 | 26.98 |
| 44373.416666666664 | 28.34 |
| 44373.427083333336 | 29.81 |
| 44373.4375 | 31.79 |
| 44373.447916666664 | 35.98 |
| 44373.458333333336 | 36.99 |
| 44373.46875 | 40.67 |
| 44373.479166666664 | 41.81 |
| 44373.489583333336 | 41.96 |
| 44373.5 | 42 |
| 44373.510416666664 | 37.65 |
| 44373.520833333336 | 38.87 |
| 44373.53125 | 38.21 |
| 44373.541666666664 | 35.08 |
| 44373.552083333336 | 33.85 |
| 44373.5625 | 30.92 |
| 44373.572916666664 | 31.86 |
| 44373.583333333336 | 26.92 |
| 44373.59375 | 23.73 |
| 44373.604166666664 | 22.04 |
| 44373.614583333336 | 19.95 |
| 44373.625 | 17.79 |
| 44373.635416666664 | 18.18 |
| 44373.645833333336 | 20.92 |
| 44373.65625 | 18.94 |
| 44373.666666666664 | 22.43 |
| 44373.677083333336 | 26.98 |
| 44373.6875 | 28.4 |
| 44373.697916666664 | 30.99 |
| 44373.708333333336 | 30.73 |
| 44373.71875 | 31.13 |
| 44373.729166666664 | 29.79 |
| 44373.739583333336 | 32.89 |
| 44373.75 | 32.1 |
| 44373.760416666664 | 30.87 |
| 44373.770833333336 | 33.92 |
| 44373.78125 | 31.82 |
| 44373.791666666664 | 37.84 |
| 44373.802083333336 | 36.79 |
| 44373.8125 | 34.38 |
| 44373.822916666664 | 31.95 |
| 44373.833333333336 | 31.97 |
| 44373.84375 | 29.5 |
| 44373.854166666664 | 26.86 |
| 44373.864583333336 | 27.85 |
| 44373.875 | 22.71 |
| 44373.885416666664 | 25.67 |
| 44373.895833333336 | 74.23 |
| 44373.90625 | 35.13 |
| 44373.916666666664 | 37.26 |
| 44373.927083333336 | 48.5 |
| 44373.9375 | 50.08 |
| 44373.947916666664 | 53.67 |
| 44373.958333333336 | 52.56 |
| 44373.96875 | 53.18 |
| 44373.979166666664 | 55.53 |
| 44373.989583333336 | 57.46 |
| 44374.0 | 58.32 |
| 44374.010416666664 | 53.38 |
| 44374.020833333336 | 53.65 |
| 44374.03125 | 50.06 |
| 44374.041666666664 | 43.76 |
| 44374.052083333336 | 37.64 |
| 44374.0625 | 36.16 |
| 44374.072916666664 | 32.8 |
| 44374.083333333336 | 29.09 |
| 44374.09375 | 29.72 |
| 44374.104166666664 | 25.61 |
| 44374.114583333336 | 22.62 |
| 44374.125 | 20.98 |
| 44374.135416666664 | 20.31 |
| 44374.145833333336 | 19.07 |
| 44374.15625 | 16.81 |
| 44374.166666666664 | 19.19 |
| 44374.177083333336 | 18.99 |
| 44374.1875 | 17.23 |
| 44374.197916666664 | 18.11 |
| 44374.208333333336 | 17.17 |
| 44374.21875 | 21.83 |
| 44374.229166666664 | 24.96 |
| 44374.239583333336 | 29.27 |
| 44374.25 | 30.04 |
| 44374.260416666664 | 32.64 |
| 44374.270833333336 | 25.14 |
| 44374.28125 | 39.36 |
| 44374.291666666664 | 43.02 |
| 44374.302083333336 | 46.78 |
| 44374.3125 | 53.23 |
| 44374.322916666664 | 52.83 |
| 44374.333333333336 | 49.1 |
| 44374.34375 | 46.06 |
| 44374.354166666664 | 42.22 |
| 44374.364583333336 | 39.43 |
| 44374.375 | 33.61 |
| 44374.385416666664 | 29.77 |
| 44374.395833333336 | 23.16 |
| 44374.40625 | 22.21 |
| 44374.416666666664 | 20.94 |
| 44374.427083333336 | 23.22 |
| 44374.4375 | 25.5 |
| 44374.447916666664 | 27.64 |
| 44374.458333333336 | 26.58 |
| 44374.46875 | 28.38 |
| 44374.479166666664 | 32.35 |
| 44374.489583333336 | 34.39 |
| 44374.5 | 34.47 |
| 44374.510416666664 | 37.07 |
| 44374.520833333336 | 37.89 |
| 44374.53125 | 34.85 |
| 44374.541666666664 | 35.09 |
| 44374.552083333336 | 38.23 |
| 44374.5625 | 34.71 |
| 44374.572916666664 | 32.96 |
| 44374.583333333336 | 34.07 |
| 44374.59375 | 31.29 |
| 44374.604166666664 | 30.98 |
| 44374.614583333336 | 28.19 |
| 44374.625 | 24.8 |
| 44374.635416666664 | 22.85 |
| 44374.645833333336 | 21.82 |
| 44374.65625 | 19.89 |
| 44374.666666666664 | 21.02 |
| 44374.677083333336 | 17.56 |
| 44374.6875 | 22.36 |
| 44374.697916666664 | 22.62 |
| 44374.708333333336 | 29.3 |
| 44374.71875 | 29.29 |
| 44374.729166666664 | 30.92 |
| 44374.739583333336 | 31.63 |
| 44374.75 | 28.46 |
| 44374.760416666664 | 27.15 |
| 44374.770833333336 | 31.79 |
| 44374.78125 | 31.88 |
| 44374.791666666664 | 32.29 |
| 44374.802083333336 | 34.95 |
| 44374.8125 | 30.14 |
| 44374.822916666664 | 30.1 |
| 44374.833333333336 | 29.55 |
| 44374.84375 | 30 |
| 44374.854166666664 | 30.18 |
| 44374.864583333336 | 28.69 |
| 44374.875 | 29.76 |
| 44374.885416666664 | 29.25 |
| 44374.895833333336 | 26.77 |
| 44374.90625 | 24.17 |
| 44374.916666666664 | 23.9 |
| 44374.927083333336 | 31.06 |
| 44374.9375 | 33.17 |
| 44374.947916666664 | 31.16 |
| 44374.958333333336 | 33.39 |
| 44374.96875 | 36.51 |
| 44374.979166666664 | 39.26 |
| 44374.989583333336 | 44.26 |
| 44375.0 | 43.31 |
| 44375.010416666664 | 44.27 |
| 44375.020833333336 | 50.88 |
| 44375.03125 | 53 |
| 44375.041666666664 | 56.47 |
| 44375.052083333336 | 49.27 |
| 44375.0625 | 46.48 |
| 44375.072916666664 | 45.55 |
| 44375.083333333336 | 45.91 |
| 44375.09375 | 40.22 |
| 44375.104166666664 | 37.5 |
| 44375.114583333336 | 34.06 |
| 44375.125 | 29.73 |
| 44375.135416666664 | 26.77 |
| 44375.145833333336 | 26.08 |
| 44375.15625 | 25.61 |
| 44375.166666666664 | 21.72 |
| 44375.177083333336 | 20.81 |
| 44375.1875 | 18.41 |
| 44375.197916666664 | 20.01 |
| 44375.208333333336 | 19.66 |
| 44375.21875 | 15.2 |
| 44375.229166666664 | 17.61 |
| 44375.239583333336 | 18.93 |
| 44375.25 | 22.44 |
| 44375.260416666664 | 25.05 |
| 44375.270833333336 | 26.81 |
| 44375.28125 | 31.15 |
| 44375.291666666664 | 34.37 |
| 44375.302083333336 | 35.21 |
| 44375.3125 | 43.11 |
| 44375.322916666664 | 44.37 |
| 44375.333333333336 | 49.37 |
| 44375.34375 | 53.86 |
| 44375.354166666664 | 48.5 |
| 44375.364583333336 | 45.35 |
| 44375.375 | 40.08 |
| 44375.385416666664 | 38.12 |
| 44375.395833333336 | 40.15 |
| 44375.40625 | 34.07 |
| 44375.416666666664 | 33.71 |
| 44375.427083333336 | 23.47 |
| 44375.4375 | 22.52 |
| 44375.447916666664 | 22.04 |
| 44375.458333333336 | 24.42 |
| 44375.46875 | 28.17 |
| 44375.479166666664 | 28.28 |
| 44375.489583333336 | 29.04 |
| 44375.5 | 32.31 |
| 44375.510416666664 | 37.01 |
| 44375.520833333336 | 38.79 |
| 44375.53125 | 37.84 |
| 44375.541666666664 | 36.85 |
| 44375.552083333336 | 39.31 |
| 44375.5625 | 37.54 |
| 44375.572916666664 | 33.96 |
| 44375.583333333336 | 34.09 |
| 44375.59375 | 32.58 |
| 44375.604166666664 | 31.66 |
| 44375.614583333336 | 30.99 |
| 44375.625 | 32.07 |
| 44375.635416666664 | 31.22 |
| 44375.645833333336 | 29.22 |
| 44375.65625 | 27.95 |
| 44375.666666666664 | 25.28 |
| 44375.677083333336 | 23.41 |
| 44375.6875 | 22.58 |
| 44375.697916666664 | 18.6 |
| 44375.708333333336 | 19.68 |
| 44375.71875 | 19.84 |
| 44375.729166666664 | 23.69 |
| 44375.739583333336 | 26.71 |
| 44375.75 | 31.46 |
| 44375.760416666664 | 28.09 |
| 44375.770833333336 | 30.44 |
| 44375.78125 | 27.46 |
| 44375.791666666664 | 28.3 |
| 44375.802083333336 | 31.27 |
| 44375.8125 | 33.77 |
| 44375.822916666664 | 33.06 |
| 44375.833333333336 | 33.97 |
| 44375.84375 | 30.62 |
| 44375.854166666664 | 29.34 |
| 44375.864583333336 | 30.46 |
| 44375.875 | 32.09 |
| 44375.885416666664 | 31.99 |
| 44375.895833333336 | 30.84 |
| 44375.90625 | 31.06 |
| 44375.916666666664 | 30.95 |
| 44375.927083333336 | 28.52 |
| 44375.9375 | 25.6 |
| 44375.947916666664 | 23.49 |
| 44375.958333333336 | 25.99 |
| 44375.96875 | 29.52 |
| 44375.979166666664 | 27.98 |
| 44375.989583333336 | 29.53 |
| 44376.0 | 34.06 |
| 44376.010416666664 | 34.69 |
| 44376.020833333336 | 37.5 |
| 44376.03125 | 40.05 |
| 44376.041666666664 | 37.5 |
| 44376.052083333336 | 41.3 |
| 44376.0625 | 40.37 |
| 44376.072916666664 | 38.56 |
| 44376.083333333336 | 41.61 |
| 44376.09375 | 35.74 |
| 44376.104166666664 | 34.52 |
| 44376.114583333336 | 33.73 |
| 44376.125 | 31.07 |
| 44376.135416666664 | 33.93 |
| 44376.145833333336 | 28.84 |
| 44376.15625 | 28.75 |
| 44376.166666666664 | 29.2 |
| 44376.177083333336 | 28.55 |
| 44376.1875 | 26.26 |
| 44376.197916666664 | 24.02 |
| 44376.208333333336 | 22.86 |
| 44376.21875 | 19.02 |
| 44376.229166666664 | 19.16 |
| 44376.239583333336 | 18.67 |
| 44376.25 | 17.4 |
| 44376.260416666664 | 18.16 |
| 44376.270833333336 | 23.31 |
| 44376.28125 | 29.82 |
| 44376.291666666664 | 29.7 |
| 44376.302083333336 | 33.06 |
| 44376.3125 | 34.88 |
| 44376.322916666664 | 42.66 |
| 44376.333333333336 | 46.97 |
| 44376.34375 | 39.49 |
| 44376.354166666664 | 41.74 |
| 44376.364583333336 | 40.56 |
| 44376.375 | 34.46 |
| 44376.385416666664 | 37.28 |
| 44376.395833333336 | 31.15 |
| 44376.40625 | 35.13 |
| 44376.416666666664 | 36.92 |
| 44376.427083333336 | 31.96 |
| 44376.4375 | 29.88 |
| 44376.447916666664 | 24.55 |
| 44376.458333333336 | 23.89 |
| 44376.46875 | 21.24 |
| 44376.479166666664 | 26.9 |
| 44376.489583333336 | 24.76 |
| 44376.5 | 26.32 |
| 44376.510416666664 | 26.93 |
| 44376.520833333336 | 26.66 |
| 44376.53125 | 26.6 |
| 44376.541666666664 | 29.98 |
| 44376.552083333336 | 33.08 |
| 44376.5625 | 31.41 |
| 44376.572916666664 | 29.43 |
| 44376.583333333336 | 29.59 |
| 44376.59375 | 31.64 |
| 44376.604166666664 | 29.65 |
| 44376.614583333336 | 30.58 |
| 44376.625 | 32.1 |
| 44376.635416666664 | 33.14 |
| 44376.645833333336 | 32.47 |
| 44376.65625 | 31.23 |
| 44376.666666666664 | 32.68 |
| 44376.677083333336 | 29.62 |
| 44376.6875 | 27.56 |
| 44376.697916666664 | 25.71 |
| 44376.708333333336 | 23.28 |
| 44376.71875 | 22.85 |
| 44376.729166666664 | 19.89 |
| 44376.739583333336 | 18.59 |
| 44376.75 | 21.19 |
| 44376.760416666664 | 21.12 |
| 44376.770833333336 | 24.48 |
| 44376.78125 | 28.51 |
| 44376.791666666664 | 29.38 |
| 44376.802083333336 | 26.24 |
| 44376.8125 | 25.62 |
| 44376.822916666664 | 26.14 |
| 44376.833333333336 | 24.48 |
| 44376.84375 | 28.89 |
| 44376.854166666664 | 28.06 |
| 44376.864583333336 | 28.32 |
| 44376.875 | 25.73 |
| 44376.885416666664 | 26.6 |
| 44376.895833333336 | 27.46 |
| 44376.90625 | 27.38 |
| 44376.916666666664 | 28.52 |
| 44376.927083333336 | 31.5 |
| 44376.9375 | 30.56 |
| 44376.947916666664 | 31.34 |
| 44376.958333333336 | 29.15 |
| 44376.96875 | 26.78 |
| 44376.979166666664 | 25.83 |
| 44376.989583333336 | 22.56 |
| 44377.0 | 25.97 |
| 44377.010416666664 | 28.32 |
| 44377.020833333336 | 26.94 |
| 44377.03125 | 29.33 |
| 44377.041666666664 | 36.26 |
| 44377.052083333336 | 39.83 |
| 44377.0625 | 43.8 |
| 44377.072916666664 | 42.48 |
| 44377.083333333336 | 43.94 |
| 44377.09375 | 40.92 |
| 44377.104166666664 | 40.34 |
| 44377.114583333336 | 41.72 |
| 44377.125 | 38.23 |
| 44377.135416666664 | 43.42 |
| 44377.145833333336 | 41.55 |
| 44377.15625 | 39.73 |
| 44377.166666666664 | 41.69 |
| 44377.177083333336 | 31.13 |
| 44377.1875 | 34.68 |
| 44377.197916666664 | 30.96 |
| 44377.208333333336 | 29.16 |
| 44377.21875 | 23.96 |
| 44377.229166666664 | 21.1 |
| 44377.239583333336 | 17.27 |
| 44377.25 | 23.84 |
| 44377.260416666664 | 18.3 |
| 44377.270833333336 | 16.74 |
| 44377.28125 | 18.35 |
| 44377.291666666664 | 20.37 |
| 44377.302083333336 | 22.73 |
| 44377.3125 | 33.99 |
| 44377.322916666664 | 23.69 |
| 44377.333333333336 | 35.86 |
| 44377.34375 | 33.92 |
| 44377.354166666664 | 30.44 |
| 44377.364583333336 | 32.95 |
| 44377.375 | 31.2 |
| 44377.385416666664 | 28.22 |
| 44377.395833333336 | 26.66 |
| 44377.40625 | 22.96 |
| 44377.416666666664 | 26.01 |
| 44377.427083333336 | 25.01 |
| 44377.4375 | 29.83 |
| 44377.447916666664 | 27.8 |
| 44377.458333333336 | 27.05 |
| 44377.46875 | 27.52 |
| 44377.479166666664 | 34.22 |
| 44377.489583333336 | 26.22 |
| 44377.5 | 24.05 |
| 44377.510416666664 | 20.33 |
| 44377.520833333336 | 23.07 |
| 44377.53125 | 22.83 |
| 44377.541666666664 | 22.9 |
| 44377.552083333336 | 21.87 |
| 44377.5625 | 29.02 |
| 44377.572916666664 | 36.35 |
| 44377.583333333336 | 37.25 |
| 44377.59375 | 35.07 |
| 44377.604166666664 | 31.72 |
| 44377.614583333336 | 31.37 |
| 44377.625 | 40.23 |
| 44377.635416666664 | 40.78 |
| 44377.645833333336 | 40.44 |
| 44377.65625 | 35.8 |
| 44377.666666666664 | 41.14 |
| 44377.677083333336 | 39.14 |
| 44377.6875 | 35.39 |
| 44377.697916666664 | 32.72 |
| 44377.708333333336 | 35.19 |
| 44377.71875 | 32.98 |
| 44377.729166666664 | 27.3 |
| 44377.739583333336 | 30 |
| 44377.75 | 23.96 |
| 44377.760416666664 | 20.96 |
| 44377.770833333336 | 20.2 |
| 44377.78125 | 14.35 |
| 44377.791666666664 | 20.83 |
| 44377.802083333336 | 24.15 |
| 44377.8125 | 20.85 |
| 44377.822916666664 | 24.43 |
| 44377.833333333336 | 27.83 |
| 44377.84375 | 27.66 |
| 44377.854166666664 | 27.25 |
| 44377.864583333336 | 24.75 |
| 44377.875 | 21.47 |
| 44377.885416666664 | 20.97 |
| 44377.895833333336 | 28.39 |
| 44377.90625 | 31.96 |
| 44377.916666666664 | 31.61 |
| 44377.927083333336 | 32.75 |
| 44377.9375 | 30.4 |
| 44377.947916666664 | 29.59 |
| 44377.958333333336 | 26.03 |
| 44377.96875 | 27.02 |
| 44377.979166666664 | 24.67 |
| 44377.989583333336 | 23.21 |
| 44378.0 | 21.24 |
| 44378.010416666664 | 20.43 |
| 44378.020833333336 | 20.98 |
| 44378.03125 | 20.45 |
| 44378.041666666664 | 21.63 |
| 44378.052083333336 | 25.18 |
| 44378.0625 | 23.4 |
| 44378.072916666664 | 25.21 |
| 44378.083333333336 | 23.38 |
| 44378.09375 | 30.72 |
| 44378.104166666664 | 36.34 |
| 44378.114583333336 | 30.11 |
| 44378.125 | 35.14 |
| 44378.135416666664 | 36.61 |
| 44378.145833333336 | 39.63 |
| 44378.15625 | 32.47 |